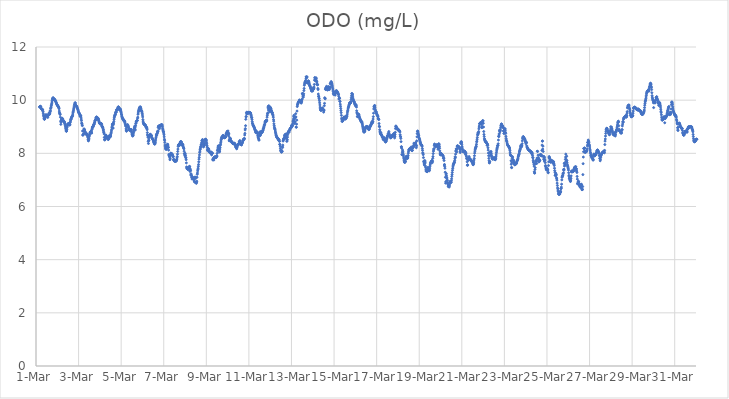
| Category | ODO (mg/L) |
|---|---|
| 44621.166666666664 | 9.74 |
| 44621.177083333336 | 9.75 |
| 44621.1875 | 9.76 |
| 44621.197916666664 | 9.76 |
| 44621.208333333336 | 9.77 |
| 44621.21875 | 9.76 |
| 44621.229166666664 | 9.74 |
| 44621.239583333336 | 9.69 |
| 44621.25 | 9.68 |
| 44621.260416666664 | 9.68 |
| 44621.270833333336 | 9.66 |
| 44621.28125 | 9.65 |
| 44621.291666666664 | 9.65 |
| 44621.302083333336 | 9.65 |
| 44621.3125 | 9.64 |
| 44621.322916666664 | 9.59 |
| 44621.333333333336 | 9.56 |
| 44621.34375 | 9.49 |
| 44621.354166666664 | 9.43 |
| 44621.364583333336 | 9.38 |
| 44621.375 | 9.32 |
| 44621.385416666664 | 9.29 |
| 44621.395833333336 | 9.28 |
| 44621.40625 | 9.29 |
| 44621.416666666664 | 9.32 |
| 44621.427083333336 | 9.34 |
| 44621.4375 | 9.38 |
| 44621.447916666664 | 9.42 |
| 44621.458333333336 | 9.44 |
| 44621.46875 | 9.45 |
| 44621.479166666664 | 9.44 |
| 44621.489583333336 | 9.43 |
| 44621.5 | 9.42 |
| 44621.510416666664 | 9.41 |
| 44621.520833333336 | 9.41 |
| 44621.53125 | 9.41 |
| 44621.541666666664 | 9.39 |
| 44621.552083333336 | 9.35 |
| 44621.5625 | 9.43 |
| 44621.572916666664 | 9.45 |
| 44621.583333333336 | 9.47 |
| 44621.59375 | 9.45 |
| 44621.604166666664 | 9.46 |
| 44621.614583333336 | 9.45 |
| 44621.625 | 9.53 |
| 44621.635416666664 | 9.48 |
| 44621.645833333336 | 9.49 |
| 44621.65625 | 9.55 |
| 44621.666666666664 | 9.6 |
| 44621.677083333336 | 9.59 |
| 44621.6875 | 9.68 |
| 44621.697916666664 | 9.71 |
| 44621.708333333336 | 9.74 |
| 44621.71875 | 9.79 |
| 44621.729166666664 | 9.83 |
| 44621.739583333336 | 9.88 |
| 44621.75 | 9.93 |
| 44621.760416666664 | 9.99 |
| 44621.770833333336 | 10.04 |
| 44621.78125 | 10.06 |
| 44621.791666666664 | 10.08 |
| 44621.802083333336 | 10.09 |
| 44621.8125 | 10.08 |
| 44621.822916666664 | 10.04 |
| 44621.833333333336 | 10.02 |
| 44621.84375 | 10.03 |
| 44621.854166666664 | 10.03 |
| 44621.864583333336 | 10.04 |
| 44621.875 | 10.03 |
| 44621.885416666664 | 10.01 |
| 44621.895833333336 | 10 |
| 44621.90625 | 9.99 |
| 44621.916666666664 | 9.97 |
| 44621.927083333336 | 9.96 |
| 44621.9375 | 9.93 |
| 44621.947916666664 | 9.91 |
| 44621.958333333336 | 9.89 |
| 44621.96875 | 9.86 |
| 44621.979166666664 | 9.84 |
| 44621.989583333336 | 9.82 |
| 44622.0 | 9.82 |
| 44622.010416666664 | 9.8 |
| 44622.020833333336 | 9.79 |
| 44622.03125 | 9.78 |
| 44622.041666666664 | 9.76 |
| 44622.052083333336 | 9.75 |
| 44622.0625 | 9.73 |
| 44622.072916666664 | 9.71 |
| 44622.083333333336 | 9.68 |
| 44622.09375 | 9.59 |
| 44622.104166666664 | 9.53 |
| 44622.114583333336 | 9.5 |
| 44622.125 | 9.48 |
| 44622.135416666664 | 9.46 |
| 44622.145833333336 | 9.36 |
| 44622.15625 | 9.21 |
| 44622.166666666664 | 9.09 |
| 44622.177083333336 | 9.17 |
| 44622.1875 | 9.25 |
| 44622.197916666664 | 9.29 |
| 44622.208333333336 | 9.28 |
| 44622.21875 | 9.29 |
| 44622.229166666664 | 9.32 |
| 44622.239583333336 | 9.3 |
| 44622.25 | 9.25 |
| 44622.260416666664 | 9.29 |
| 44622.270833333336 | 9.25 |
| 44622.28125 | 9.23 |
| 44622.291666666664 | 9.2 |
| 44622.302083333336 | 9.21 |
| 44622.3125 | 9.18 |
| 44622.322916666664 | 9.2 |
| 44622.333333333336 | 9.18 |
| 44622.34375 | 9.15 |
| 44622.354166666664 | 9.12 |
| 44622.364583333336 | 9.09 |
| 44622.375 | 9.04 |
| 44622.385416666664 | 8.99 |
| 44622.395833333336 | 8.93 |
| 44622.40625 | 8.88 |
| 44622.416666666664 | 8.84 |
| 44622.427083333336 | 8.83 |
| 44622.4375 | 8.84 |
| 44622.447916666664 | 8.9 |
| 44622.458333333336 | 8.97 |
| 44622.46875 | 9.02 |
| 44622.479166666664 | 9.06 |
| 44622.489583333336 | 9.09 |
| 44622.5 | 9.11 |
| 44622.510416666664 | 9.11 |
| 44622.520833333336 | 9.11 |
| 44622.53125 | 9.1 |
| 44622.541666666664 | 9.1 |
| 44622.552083333336 | 9.11 |
| 44622.5625 | 9.12 |
| 44622.572916666664 | 9.13 |
| 44622.583333333336 | 9.06 |
| 44622.59375 | 9.08 |
| 44622.604166666664 | 9.16 |
| 44622.614583333336 | 9.19 |
| 44622.625 | 9.25 |
| 44622.635416666664 | 9.27 |
| 44622.645833333336 | 9.31 |
| 44622.65625 | 9.29 |
| 44622.666666666664 | 9.35 |
| 44622.677083333336 | 9.35 |
| 44622.6875 | 9.39 |
| 44622.697916666664 | 9.39 |
| 44622.708333333336 | 9.4 |
| 44622.71875 | 9.43 |
| 44622.729166666664 | 9.48 |
| 44622.739583333336 | 9.54 |
| 44622.75 | 9.57 |
| 44622.760416666664 | 9.62 |
| 44622.770833333336 | 9.67 |
| 44622.78125 | 9.71 |
| 44622.791666666664 | 9.75 |
| 44622.802083333336 | 9.8 |
| 44622.8125 | 9.84 |
| 44622.822916666664 | 9.86 |
| 44622.833333333336 | 9.9 |
| 44622.84375 | 9.9 |
| 44622.854166666664 | 9.85 |
| 44622.864583333336 | 9.8 |
| 44622.875 | 9.8 |
| 44622.885416666664 | 9.79 |
| 44622.895833333336 | 9.78 |
| 44622.90625 | 9.76 |
| 44622.916666666664 | 9.76 |
| 44622.927083333336 | 9.73 |
| 44622.9375 | 9.7 |
| 44622.947916666664 | 9.69 |
| 44622.958333333336 | 9.67 |
| 44622.96875 | 9.65 |
| 44622.979166666664 | 9.61 |
| 44622.989583333336 | 9.58 |
| 44623.0 | 9.54 |
| 44623.010416666664 | 9.53 |
| 44623.020833333336 | 9.52 |
| 44623.03125 | 9.5 |
| 44623.041666666664 | 9.48 |
| 44623.052083333336 | 9.47 |
| 44623.0625 | 9.42 |
| 44623.072916666664 | 9.4 |
| 44623.083333333336 | 9.39 |
| 44623.09375 | 9.43 |
| 44623.104166666664 | 9.41 |
| 44623.114583333336 | 9.36 |
| 44623.125 | 9.29 |
| 44623.135416666664 | 9.23 |
| 44623.145833333336 | 9.14 |
| 44623.15625 | 9.12 |
| 44623.166666666664 | 9.07 |
| 44623.177083333336 | 9.04 |
| 44623.1875 | 8.84 |
| 44623.197916666664 | 8.68 |
| 44623.208333333336 | 8.7 |
| 44623.21875 | 8.7 |
| 44623.229166666664 | 8.73 |
| 44623.239583333336 | 8.83 |
| 44623.25 | 8.91 |
| 44623.260416666664 | 8.92 |
| 44623.270833333336 | 8.89 |
| 44623.28125 | 8.88 |
| 44623.291666666664 | 8.84 |
| 44623.302083333336 | 8.79 |
| 44623.3125 | 8.77 |
| 44623.322916666664 | 8.75 |
| 44623.333333333336 | 8.79 |
| 44623.34375 | 8.75 |
| 44623.354166666664 | 8.72 |
| 44623.364583333336 | 8.71 |
| 44623.375 | 8.72 |
| 44623.385416666664 | 8.72 |
| 44623.395833333336 | 8.73 |
| 44623.40625 | 8.7 |
| 44623.416666666664 | 8.67 |
| 44623.427083333336 | 8.63 |
| 44623.4375 | 8.59 |
| 44623.447916666664 | 8.52 |
| 44623.458333333336 | 8.47 |
| 44623.46875 | 8.48 |
| 44623.479166666664 | 8.51 |
| 44623.489583333336 | 8.57 |
| 44623.5 | 8.63 |
| 44623.510416666664 | 8.68 |
| 44623.520833333336 | 8.72 |
| 44623.53125 | 8.76 |
| 44623.541666666664 | 8.79 |
| 44623.552083333336 | 8.8 |
| 44623.5625 | 8.81 |
| 44623.572916666664 | 8.81 |
| 44623.583333333336 | 8.82 |
| 44623.59375 | 8.83 |
| 44623.604166666664 | 8.78 |
| 44623.614583333336 | 8.76 |
| 44623.625 | 8.89 |
| 44623.635416666664 | 8.92 |
| 44623.645833333336 | 8.96 |
| 44623.65625 | 8.99 |
| 44623.666666666664 | 9 |
| 44623.677083333336 | 9.01 |
| 44623.6875 | 9 |
| 44623.697916666664 | 9.05 |
| 44623.708333333336 | 9.07 |
| 44623.71875 | 9.09 |
| 44623.729166666664 | 9.09 |
| 44623.739583333336 | 9.12 |
| 44623.75 | 9.16 |
| 44623.760416666664 | 9.18 |
| 44623.770833333336 | 9.23 |
| 44623.78125 | 9.23 |
| 44623.791666666664 | 9.25 |
| 44623.802083333336 | 9.27 |
| 44623.8125 | 9.32 |
| 44623.822916666664 | 9.34 |
| 44623.833333333336 | 9.35 |
| 44623.84375 | 9.37 |
| 44623.854166666664 | 9.36 |
| 44623.864583333336 | 9.35 |
| 44623.875 | 9.33 |
| 44623.885416666664 | 9.33 |
| 44623.895833333336 | 9.3 |
| 44623.90625 | 9.28 |
| 44623.916666666664 | 9.32 |
| 44623.927083333336 | 9.3 |
| 44623.9375 | 9.27 |
| 44623.947916666664 | 9.23 |
| 44623.958333333336 | 9.2 |
| 44623.96875 | 9.17 |
| 44623.979166666664 | 9.14 |
| 44623.989583333336 | 9.14 |
| 44624.0 | 9.13 |
| 44624.010416666664 | 9.11 |
| 44624.020833333336 | 9.1 |
| 44624.03125 | 9.11 |
| 44624.041666666664 | 9.12 |
| 44624.052083333336 | 9.13 |
| 44624.0625 | 9.12 |
| 44624.072916666664 | 9.11 |
| 44624.083333333336 | 9.08 |
| 44624.09375 | 9.03 |
| 44624.104166666664 | 9 |
| 44624.114583333336 | 9.01 |
| 44624.125 | 8.99 |
| 44624.135416666664 | 8.97 |
| 44624.145833333336 | 8.94 |
| 44624.15625 | 8.88 |
| 44624.166666666664 | 8.88 |
| 44624.177083333336 | 8.81 |
| 44624.1875 | 8.78 |
| 44624.197916666664 | 8.73 |
| 44624.208333333336 | 8.6 |
| 44624.21875 | 8.52 |
| 44624.229166666664 | 8.5 |
| 44624.239583333336 | 8.52 |
| 44624.25 | 8.59 |
| 44624.260416666664 | 8.61 |
| 44624.270833333336 | 8.67 |
| 44624.28125 | 8.69 |
| 44624.291666666664 | 8.66 |
| 44624.302083333336 | 8.65 |
| 44624.3125 | 8.63 |
| 44624.322916666664 | 8.61 |
| 44624.333333333336 | 8.58 |
| 44624.34375 | 8.59 |
| 44624.354166666664 | 8.56 |
| 44624.364583333336 | 8.58 |
| 44624.375 | 8.56 |
| 44624.385416666664 | 8.53 |
| 44624.395833333336 | 8.52 |
| 44624.40625 | 8.53 |
| 44624.416666666664 | 8.56 |
| 44624.427083333336 | 8.62 |
| 44624.4375 | 8.66 |
| 44624.447916666664 | 8.66 |
| 44624.458333333336 | 8.65 |
| 44624.46875 | 8.63 |
| 44624.479166666664 | 8.62 |
| 44624.489583333336 | 8.62 |
| 44624.5 | 8.65 |
| 44624.510416666664 | 8.69 |
| 44624.520833333336 | 8.74 |
| 44624.53125 | 8.78 |
| 44624.541666666664 | 8.84 |
| 44624.552083333336 | 8.89 |
| 44624.5625 | 8.96 |
| 44624.572916666664 | 9.02 |
| 44624.583333333336 | 9.07 |
| 44624.59375 | 9.1 |
| 44624.604166666664 | 9.11 |
| 44624.614583333336 | 9.11 |
| 44624.625 | 8.95 |
| 44624.635416666664 | 9.08 |
| 44624.645833333336 | 9.14 |
| 44624.65625 | 9.2 |
| 44624.666666666664 | 9.28 |
| 44624.677083333336 | 9.34 |
| 44624.6875 | 9.39 |
| 44624.697916666664 | 9.42 |
| 44624.708333333336 | 9.44 |
| 44624.71875 | 9.47 |
| 44624.729166666664 | 9.46 |
| 44624.739583333336 | 9.54 |
| 44624.75 | 9.55 |
| 44624.760416666664 | 9.54 |
| 44624.770833333336 | 9.56 |
| 44624.78125 | 9.64 |
| 44624.791666666664 | 9.62 |
| 44624.802083333336 | 9.63 |
| 44624.8125 | 9.65 |
| 44624.822916666664 | 9.65 |
| 44624.833333333336 | 9.65 |
| 44624.84375 | 9.71 |
| 44624.854166666664 | 9.73 |
| 44624.864583333336 | 9.75 |
| 44624.875 | 9.74 |
| 44624.885416666664 | 9.73 |
| 44624.895833333336 | 9.71 |
| 44624.90625 | 9.68 |
| 44624.916666666664 | 9.65 |
| 44624.927083333336 | 9.64 |
| 44624.9375 | 9.65 |
| 44624.947916666664 | 9.67 |
| 44624.958333333336 | 9.67 |
| 44624.96875 | 9.64 |
| 44624.979166666664 | 9.6 |
| 44624.989583333336 | 9.57 |
| 44625.0 | 9.53 |
| 44625.010416666664 | 9.48 |
| 44625.020833333336 | 9.45 |
| 44625.03125 | 9.4 |
| 44625.041666666664 | 9.37 |
| 44625.052083333336 | 9.34 |
| 44625.0625 | 9.32 |
| 44625.072916666664 | 9.3 |
| 44625.083333333336 | 9.29 |
| 44625.09375 | 9.27 |
| 44625.104166666664 | 9.27 |
| 44625.114583333336 | 9.26 |
| 44625.125 | 9.25 |
| 44625.135416666664 | 9.22 |
| 44625.145833333336 | 9.2 |
| 44625.15625 | 9.22 |
| 44625.166666666664 | 9.2 |
| 44625.177083333336 | 9.17 |
| 44625.1875 | 9.12 |
| 44625.197916666664 | 9.09 |
| 44625.208333333336 | 9.04 |
| 44625.21875 | 9.02 |
| 44625.229166666664 | 8.92 |
| 44625.239583333336 | 8.87 |
| 44625.25 | 8.83 |
| 44625.260416666664 | 8.86 |
| 44625.270833333336 | 8.98 |
| 44625.28125 | 9.03 |
| 44625.291666666664 | 9.06 |
| 44625.302083333336 | 9.08 |
| 44625.3125 | 9.06 |
| 44625.322916666664 | 9.03 |
| 44625.333333333336 | 9.02 |
| 44625.34375 | 8.98 |
| 44625.354166666664 | 8.95 |
| 44625.364583333336 | 8.9 |
| 44625.375 | 8.91 |
| 44625.385416666664 | 8.87 |
| 44625.395833333336 | 8.89 |
| 44625.40625 | 8.86 |
| 44625.416666666664 | 8.88 |
| 44625.427083333336 | 8.88 |
| 44625.4375 | 8.88 |
| 44625.447916666664 | 8.89 |
| 44625.458333333336 | 8.9 |
| 44625.46875 | 8.89 |
| 44625.479166666664 | 8.86 |
| 44625.489583333336 | 8.81 |
| 44625.5 | 8.77 |
| 44625.510416666664 | 8.72 |
| 44625.520833333336 | 8.69 |
| 44625.53125 | 8.67 |
| 44625.541666666664 | 8.65 |
| 44625.552083333336 | 8.66 |
| 44625.5625 | 8.68 |
| 44625.572916666664 | 8.73 |
| 44625.583333333336 | 8.79 |
| 44625.59375 | 8.84 |
| 44625.604166666664 | 8.89 |
| 44625.614583333336 | 8.94 |
| 44625.625 | 8.97 |
| 44625.635416666664 | 9.01 |
| 44625.645833333336 | 9.03 |
| 44625.65625 | 8.96 |
| 44625.666666666664 | 8.88 |
| 44625.677083333336 | 9.04 |
| 44625.6875 | 9.12 |
| 44625.697916666664 | 9.14 |
| 44625.708333333336 | 9.19 |
| 44625.71875 | 9.2 |
| 44625.729166666664 | 9.21 |
| 44625.739583333336 | 9.23 |
| 44625.75 | 9.23 |
| 44625.760416666664 | 9.24 |
| 44625.770833333336 | 9.32 |
| 44625.78125 | 9.36 |
| 44625.791666666664 | 9.47 |
| 44625.802083333336 | 9.52 |
| 44625.8125 | 9.58 |
| 44625.822916666664 | 9.6 |
| 44625.833333333336 | 9.65 |
| 44625.84375 | 9.67 |
| 44625.854166666664 | 9.7 |
| 44625.864583333336 | 9.72 |
| 44625.875 | 9.74 |
| 44625.885416666664 | 9.71 |
| 44625.895833333336 | 9.7 |
| 44625.90625 | 9.75 |
| 44625.916666666664 | 9.71 |
| 44625.927083333336 | 9.69 |
| 44625.9375 | 9.62 |
| 44625.947916666664 | 9.61 |
| 44625.958333333336 | 9.61 |
| 44625.96875 | 9.58 |
| 44625.979166666664 | 9.55 |
| 44625.989583333336 | 9.5 |
| 44626.0 | 9.44 |
| 44626.010416666664 | 9.37 |
| 44626.020833333336 | 9.27 |
| 44626.03125 | 9.21 |
| 44626.041666666664 | 9.16 |
| 44626.052083333336 | 9.13 |
| 44626.0625 | 9.11 |
| 44626.072916666664 | 9.09 |
| 44626.083333333336 | 9.08 |
| 44626.09375 | 9.08 |
| 44626.104166666664 | 9.08 |
| 44626.114583333336 | 9.08 |
| 44626.125 | 9.07 |
| 44626.135416666664 | 9.06 |
| 44626.145833333336 | 9.04 |
| 44626.15625 | 9.02 |
| 44626.166666666664 | 8.99 |
| 44626.177083333336 | 8.97 |
| 44626.1875 | 8.99 |
| 44626.197916666664 | 8.97 |
| 44626.208333333336 | 8.94 |
| 44626.21875 | 8.89 |
| 44626.229166666664 | 8.78 |
| 44626.239583333336 | 8.7 |
| 44626.25 | 8.66 |
| 44626.260416666664 | 8.6 |
| 44626.270833333336 | 8.45 |
| 44626.28125 | 8.37 |
| 44626.291666666664 | 8.5 |
| 44626.302083333336 | 8.48 |
| 44626.3125 | 8.58 |
| 44626.322916666664 | 8.64 |
| 44626.333333333336 | 8.63 |
| 44626.34375 | 8.69 |
| 44626.354166666664 | 8.7 |
| 44626.364583333336 | 8.72 |
| 44626.375 | 8.69 |
| 44626.385416666664 | 8.7 |
| 44626.395833333336 | 8.69 |
| 44626.40625 | 8.68 |
| 44626.416666666664 | 8.67 |
| 44626.427083333336 | 8.66 |
| 44626.4375 | 8.6 |
| 44626.447916666664 | 8.58 |
| 44626.458333333336 | 8.55 |
| 44626.46875 | 8.55 |
| 44626.479166666664 | 8.54 |
| 44626.489583333336 | 8.53 |
| 44626.5 | 8.52 |
| 44626.510416666664 | 8.48 |
| 44626.520833333336 | 8.45 |
| 44626.53125 | 8.42 |
| 44626.541666666664 | 8.41 |
| 44626.552083333336 | 8.38 |
| 44626.5625 | 8.36 |
| 44626.572916666664 | 8.35 |
| 44626.583333333336 | 8.35 |
| 44626.59375 | 8.37 |
| 44626.604166666664 | 8.41 |
| 44626.614583333336 | 8.47 |
| 44626.625 | 8.54 |
| 44626.635416666664 | 8.59 |
| 44626.645833333336 | 8.65 |
| 44626.65625 | 8.7 |
| 44626.666666666664 | 8.72 |
| 44626.677083333336 | 8.69 |
| 44626.6875 | 8.74 |
| 44626.697916666664 | 8.76 |
| 44626.708333333336 | 8.81 |
| 44626.71875 | 8.84 |
| 44626.729166666664 | 8.82 |
| 44626.739583333336 | 8.97 |
| 44626.75 | 9.02 |
| 44626.760416666664 | 9.02 |
| 44626.770833333336 | 9.02 |
| 44626.78125 | 9.01 |
| 44626.791666666664 | 8.92 |
| 44626.802083333336 | 8.96 |
| 44626.8125 | 9.02 |
| 44626.822916666664 | 9.05 |
| 44626.833333333336 | 9.05 |
| 44626.84375 | 9.06 |
| 44626.854166666664 | 9.04 |
| 44626.864583333336 | 9.05 |
| 44626.875 | 9.05 |
| 44626.885416666664 | 9.07 |
| 44626.895833333336 | 9.08 |
| 44626.90625 | 9.08 |
| 44626.916666666664 | 9.06 |
| 44626.927083333336 | 9.06 |
| 44626.9375 | 9 |
| 44626.947916666664 | 8.94 |
| 44626.958333333336 | 8.9 |
| 44626.96875 | 8.86 |
| 44626.979166666664 | 8.82 |
| 44626.989583333336 | 8.81 |
| 44627.0 | 8.76 |
| 44627.010416666664 | 8.7 |
| 44627.020833333336 | 8.62 |
| 44627.03125 | 8.53 |
| 44627.041666666664 | 8.49 |
| 44627.052083333336 | 8.41 |
| 44627.0625 | 8.31 |
| 44627.072916666664 | 8.25 |
| 44627.083333333336 | 8.2 |
| 44627.09375 | 8.17 |
| 44627.104166666664 | 8.16 |
| 44627.114583333336 | 8.15 |
| 44627.125 | 8.16 |
| 44627.135416666664 | 8.21 |
| 44627.145833333336 | 8.26 |
| 44627.15625 | 8.3 |
| 44627.166666666664 | 8.33 |
| 44627.177083333336 | 8.33 |
| 44627.1875 | 8.34 |
| 44627.197916666664 | 8.28 |
| 44627.208333333336 | 8.23 |
| 44627.21875 | 8.22 |
| 44627.229166666664 | 8.12 |
| 44627.239583333336 | 7.96 |
| 44627.25 | 7.91 |
| 44627.260416666664 | 7.91 |
| 44627.270833333336 | 7.89 |
| 44627.28125 | 7.85 |
| 44627.291666666664 | 7.76 |
| 44627.302083333336 | 7.81 |
| 44627.3125 | 7.93 |
| 44627.322916666664 | 7.97 |
| 44627.333333333336 | 8.01 |
| 44627.34375 | 8 |
| 44627.354166666664 | 7.99 |
| 44627.364583333336 | 7.99 |
| 44627.375 | 7.98 |
| 44627.385416666664 | 7.98 |
| 44627.395833333336 | 7.96 |
| 44627.40625 | 7.94 |
| 44627.416666666664 | 7.92 |
| 44627.427083333336 | 7.9 |
| 44627.4375 | 7.88 |
| 44627.447916666664 | 7.87 |
| 44627.458333333336 | 7.77 |
| 44627.46875 | 7.74 |
| 44627.479166666664 | 7.77 |
| 44627.489583333336 | 7.74 |
| 44627.5 | 7.71 |
| 44627.510416666664 | 7.7 |
| 44627.520833333336 | 7.72 |
| 44627.53125 | 7.73 |
| 44627.541666666664 | 7.73 |
| 44627.552083333336 | 7.7 |
| 44627.5625 | 7.7 |
| 44627.572916666664 | 7.71 |
| 44627.583333333336 | 7.71 |
| 44627.59375 | 7.73 |
| 44627.604166666664 | 7.75 |
| 44627.614583333336 | 7.78 |
| 44627.625 | 7.83 |
| 44627.635416666664 | 7.88 |
| 44627.645833333336 | 7.97 |
| 44627.65625 | 8.07 |
| 44627.666666666664 | 8.16 |
| 44627.677083333336 | 8.26 |
| 44627.6875 | 8.3 |
| 44627.697916666664 | 8.32 |
| 44627.708333333336 | 8.33 |
| 44627.71875 | 8.33 |
| 44627.729166666664 | 8.29 |
| 44627.739583333336 | 8.31 |
| 44627.75 | 8.34 |
| 44627.760416666664 | 8.37 |
| 44627.770833333336 | 8.42 |
| 44627.78125 | 8.42 |
| 44627.791666666664 | 8.44 |
| 44627.802083333336 | 8.44 |
| 44627.8125 | 8.43 |
| 44627.822916666664 | 8.43 |
| 44627.833333333336 | 8.41 |
| 44627.84375 | 8.36 |
| 44627.854166666664 | 8.31 |
| 44627.864583333336 | 8.31 |
| 44627.875 | 8.34 |
| 44627.885416666664 | 8.34 |
| 44627.895833333336 | 8.33 |
| 44627.90625 | 8.28 |
| 44627.916666666664 | 8.24 |
| 44627.927083333336 | 8.21 |
| 44627.9375 | 8.2 |
| 44627.947916666664 | 8.17 |
| 44627.958333333336 | 8.08 |
| 44627.96875 | 7.99 |
| 44627.979166666664 | 7.98 |
| 44627.989583333336 | 7.91 |
| 44628.0 | 8 |
| 44628.010416666664 | 7.97 |
| 44628.020833333336 | 7.91 |
| 44628.03125 | 7.84 |
| 44628.041666666664 | 7.83 |
| 44628.052083333336 | 7.76 |
| 44628.0625 | 7.64 |
| 44628.072916666664 | 7.49 |
| 44628.083333333336 | 7.43 |
| 44628.09375 | 7.46 |
| 44628.104166666664 | 7.46 |
| 44628.114583333336 | 7.43 |
| 44628.125 | 7.41 |
| 44628.135416666664 | 7.4 |
| 44628.145833333336 | 7.39 |
| 44628.15625 | 7.42 |
| 44628.166666666664 | 7.45 |
| 44628.177083333336 | 7.45 |
| 44628.1875 | 7.48 |
| 44628.197916666664 | 7.49 |
| 44628.208333333336 | 7.51 |
| 44628.21875 | 7.5 |
| 44628.229166666664 | 7.32 |
| 44628.239583333336 | 7.42 |
| 44628.25 | 7.38 |
| 44628.260416666664 | 7.35 |
| 44628.270833333336 | 7.19 |
| 44628.28125 | 7.23 |
| 44628.291666666664 | 7.17 |
| 44628.302083333336 | 7.18 |
| 44628.3125 | 7.09 |
| 44628.322916666664 | 7.12 |
| 44628.333333333336 | 7.03 |
| 44628.34375 | 7.06 |
| 44628.354166666664 | 7.1 |
| 44628.364583333336 | 7.09 |
| 44628.375 | 7.06 |
| 44628.385416666664 | 7.06 |
| 44628.395833333336 | 7.03 |
| 44628.40625 | 7.05 |
| 44628.416666666664 | 7.03 |
| 44628.427083333336 | 7 |
| 44628.4375 | 6.95 |
| 44628.447916666664 | 6.93 |
| 44628.458333333336 | 6.92 |
| 44628.46875 | 7.11 |
| 44628.479166666664 | 7.08 |
| 44628.489583333336 | 7.09 |
| 44628.5 | 7.06 |
| 44628.510416666664 | 6.9 |
| 44628.520833333336 | 6.91 |
| 44628.53125 | 6.87 |
| 44628.541666666664 | 6.91 |
| 44628.552083333336 | 6.95 |
| 44628.5625 | 7.1 |
| 44628.572916666664 | 7.21 |
| 44628.583333333336 | 7.26 |
| 44628.59375 | 7.34 |
| 44628.604166666664 | 7.39 |
| 44628.614583333336 | 7.44 |
| 44628.625 | 7.51 |
| 44628.635416666664 | 7.58 |
| 44628.645833333336 | 7.68 |
| 44628.65625 | 7.78 |
| 44628.666666666664 | 7.85 |
| 44628.677083333336 | 7.94 |
| 44628.6875 | 8.03 |
| 44628.697916666664 | 8.08 |
| 44628.708333333336 | 8.14 |
| 44628.71875 | 8.17 |
| 44628.729166666664 | 8.22 |
| 44628.739583333336 | 8.26 |
| 44628.75 | 8.27 |
| 44628.760416666664 | 8.33 |
| 44628.770833333336 | 8.34 |
| 44628.78125 | 8.4 |
| 44628.791666666664 | 8.47 |
| 44628.802083333336 | 8.49 |
| 44628.8125 | 8.46 |
| 44628.822916666664 | 8.52 |
| 44628.833333333336 | 8.48 |
| 44628.84375 | 8.42 |
| 44628.854166666664 | 8.34 |
| 44628.864583333336 | 8.24 |
| 44628.875 | 8.3 |
| 44628.885416666664 | 8.28 |
| 44628.895833333336 | 8.29 |
| 44628.90625 | 8.31 |
| 44628.916666666664 | 8.35 |
| 44628.927083333336 | 8.38 |
| 44628.9375 | 8.46 |
| 44628.947916666664 | 8.52 |
| 44628.958333333336 | 8.53 |
| 44628.96875 | 8.52 |
| 44628.979166666664 | 8.52 |
| 44628.989583333336 | 8.5 |
| 44629.0 | 8.49 |
| 44629.010416666664 | 8.42 |
| 44629.020833333336 | 8.36 |
| 44629.03125 | 8.29 |
| 44629.041666666664 | 8.23 |
| 44629.052083333336 | 8.13 |
| 44629.0625 | 8.1 |
| 44629.072916666664 | 8.15 |
| 44629.083333333336 | 8.18 |
| 44629.09375 | 8.18 |
| 44629.104166666664 | 8.17 |
| 44629.114583333336 | 8.14 |
| 44629.125 | 8.1 |
| 44629.135416666664 | 8.06 |
| 44629.145833333336 | 8.04 |
| 44629.15625 | 8.05 |
| 44629.166666666664 | 8.06 |
| 44629.177083333336 | 8.03 |
| 44629.1875 | 8.01 |
| 44629.197916666664 | 8 |
| 44629.208333333336 | 8.01 |
| 44629.21875 | 8.03 |
| 44629.229166666664 | 8.05 |
| 44629.239583333336 | 8.03 |
| 44629.25 | 7.94 |
| 44629.260416666664 | 7.99 |
| 44629.270833333336 | 8 |
| 44629.28125 | 8.01 |
| 44629.291666666664 | 8 |
| 44629.302083333336 | 7.76 |
| 44629.3125 | 7.75 |
| 44629.322916666664 | 7.81 |
| 44629.333333333336 | 7.8 |
| 44629.34375 | 7.78 |
| 44629.354166666664 | 7.75 |
| 44629.364583333336 | 7.81 |
| 44629.375 | 7.85 |
| 44629.385416666664 | 7.86 |
| 44629.395833333336 | 7.86 |
| 44629.40625 | 7.86 |
| 44629.416666666664 | 7.85 |
| 44629.427083333336 | 7.85 |
| 44629.4375 | 7.85 |
| 44629.447916666664 | 7.86 |
| 44629.458333333336 | 7.85 |
| 44629.46875 | 7.84 |
| 44629.479166666664 | 7.89 |
| 44629.489583333336 | 7.91 |
| 44629.5 | 7.89 |
| 44629.510416666664 | 8 |
| 44629.520833333336 | 8.1 |
| 44629.53125 | 8.13 |
| 44629.541666666664 | 8.2 |
| 44629.552083333336 | 8.24 |
| 44629.5625 | 8.28 |
| 44629.572916666664 | 8.28 |
| 44629.583333333336 | 8.16 |
| 44629.59375 | 8.11 |
| 44629.604166666664 | 8.08 |
| 44629.614583333336 | 8.05 |
| 44629.625 | 8.08 |
| 44629.635416666664 | 8.16 |
| 44629.645833333336 | 8.22 |
| 44629.65625 | 8.3 |
| 44629.666666666664 | 8.34 |
| 44629.677083333336 | 8.4 |
| 44629.6875 | 8.46 |
| 44629.697916666664 | 8.51 |
| 44629.708333333336 | 8.55 |
| 44629.71875 | 8.6 |
| 44629.729166666664 | 8.61 |
| 44629.739583333336 | 8.61 |
| 44629.75 | 8.58 |
| 44629.760416666664 | 8.59 |
| 44629.770833333336 | 8.67 |
| 44629.78125 | 8.59 |
| 44629.791666666664 | 8.62 |
| 44629.802083333336 | 8.67 |
| 44629.8125 | 8.65 |
| 44629.822916666664 | 8.61 |
| 44629.833333333336 | 8.6 |
| 44629.84375 | 8.59 |
| 44629.854166666664 | 8.59 |
| 44629.864583333336 | 8.59 |
| 44629.875 | 8.6 |
| 44629.885416666664 | 8.62 |
| 44629.895833333336 | 8.6 |
| 44629.90625 | 8.65 |
| 44629.916666666664 | 8.62 |
| 44629.927083333336 | 8.72 |
| 44629.9375 | 8.74 |
| 44629.947916666664 | 8.75 |
| 44629.958333333336 | 8.79 |
| 44629.96875 | 8.77 |
| 44629.979166666664 | 8.83 |
| 44629.989583333336 | 8.79 |
| 44630.0 | 8.73 |
| 44630.010416666664 | 8.71 |
| 44630.020833333336 | 8.84 |
| 44630.03125 | 8.76 |
| 44630.041666666664 | 8.76 |
| 44630.052083333336 | 8.65 |
| 44630.0625 | 8.73 |
| 44630.072916666664 | 8.47 |
| 44630.083333333336 | 8.51 |
| 44630.09375 | 8.49 |
| 44630.104166666664 | 8.58 |
| 44630.114583333336 | 8.57 |
| 44630.125 | 8.56 |
| 44630.135416666664 | 8.54 |
| 44630.145833333336 | 8.48 |
| 44630.15625 | 8.47 |
| 44630.166666666664 | 8.46 |
| 44630.177083333336 | 8.44 |
| 44630.1875 | 8.44 |
| 44630.197916666664 | 8.42 |
| 44630.208333333336 | 8.4 |
| 44630.21875 | 8.39 |
| 44630.229166666664 | 8.39 |
| 44630.239583333336 | 8.38 |
| 44630.25 | 8.37 |
| 44630.260416666664 | 8.37 |
| 44630.270833333336 | 8.37 |
| 44630.28125 | 8.38 |
| 44630.291666666664 | 8.35 |
| 44630.302083333336 | 8.39 |
| 44630.3125 | 8.36 |
| 44630.322916666664 | 8.37 |
| 44630.333333333336 | 8.37 |
| 44630.34375 | 8.35 |
| 44630.354166666664 | 8.33 |
| 44630.364583333336 | 8.3 |
| 44630.375 | 8.26 |
| 44630.385416666664 | 8.23 |
| 44630.395833333336 | 8.24 |
| 44630.40625 | 8.21 |
| 44630.416666666664 | 8.19 |
| 44630.427083333336 | 8.17 |
| 44630.4375 | 8.23 |
| 44630.447916666664 | 8.24 |
| 44630.458333333336 | 8.3 |
| 44630.46875 | 8.3 |
| 44630.479166666664 | 8.33 |
| 44630.489583333336 | 8.31 |
| 44630.5 | 8.33 |
| 44630.510416666664 | 8.36 |
| 44630.520833333336 | 8.35 |
| 44630.53125 | 8.35 |
| 44630.541666666664 | 8.43 |
| 44630.552083333336 | 8.43 |
| 44630.5625 | 8.44 |
| 44630.572916666664 | 8.48 |
| 44630.583333333336 | 8.46 |
| 44630.59375 | 8.37 |
| 44630.604166666664 | 8.37 |
| 44630.614583333336 | 8.35 |
| 44630.625 | 8.34 |
| 44630.635416666664 | 8.33 |
| 44630.645833333336 | 8.32 |
| 44630.65625 | 8.32 |
| 44630.666666666664 | 8.36 |
| 44630.677083333336 | 8.38 |
| 44630.6875 | 8.4 |
| 44630.697916666664 | 8.41 |
| 44630.708333333336 | 8.46 |
| 44630.71875 | 8.47 |
| 44630.729166666664 | 8.5 |
| 44630.739583333336 | 8.51 |
| 44630.75 | 8.53 |
| 44630.760416666664 | 8.54 |
| 44630.770833333336 | 8.52 |
| 44630.78125 | 8.55 |
| 44630.791666666664 | 8.56 |
| 44630.802083333336 | 8.69 |
| 44630.8125 | 8.75 |
| 44630.822916666664 | 8.88 |
| 44630.833333333336 | 8.93 |
| 44630.84375 | 9.04 |
| 44630.854166666664 | 9.28 |
| 44630.864583333336 | 9.37 |
| 44630.875 | 9.39 |
| 44630.885416666664 | 9.53 |
| 44630.895833333336 | 9.48 |
| 44630.90625 | 9.55 |
| 44630.916666666664 | 9.5 |
| 44630.927083333336 | 9.52 |
| 44630.9375 | 9.52 |
| 44630.947916666664 | 9.52 |
| 44630.958333333336 | 9.52 |
| 44630.96875 | 9.51 |
| 44630.979166666664 | 9.52 |
| 44630.989583333336 | 9.53 |
| 44631.0 | 9.55 |
| 44631.010416666664 | 9.52 |
| 44631.020833333336 | 9.53 |
| 44631.03125 | 9.53 |
| 44631.041666666664 | 9.53 |
| 44631.052083333336 | 9.53 |
| 44631.0625 | 9.52 |
| 44631.072916666664 | 9.52 |
| 44631.083333333336 | 9.51 |
| 44631.09375 | 9.45 |
| 44631.104166666664 | 9.44 |
| 44631.114583333336 | 9.4 |
| 44631.125 | 9.34 |
| 44631.135416666664 | 9.34 |
| 44631.145833333336 | 9.27 |
| 44631.15625 | 9.19 |
| 44631.166666666664 | 9.13 |
| 44631.177083333336 | 9.11 |
| 44631.1875 | 9.07 |
| 44631.197916666664 | 9.06 |
| 44631.208333333336 | 9.04 |
| 44631.21875 | 9.03 |
| 44631.229166666664 | 9.01 |
| 44631.239583333336 | 8.99 |
| 44631.25 | 8.97 |
| 44631.260416666664 | 8.95 |
| 44631.270833333336 | 8.92 |
| 44631.28125 | 8.89 |
| 44631.291666666664 | 8.88 |
| 44631.302083333336 | 8.86 |
| 44631.3125 | 8.82 |
| 44631.322916666664 | 8.78 |
| 44631.333333333336 | 8.79 |
| 44631.34375 | 8.84 |
| 44631.354166666664 | 8.82 |
| 44631.364583333336 | 8.79 |
| 44631.375 | 8.78 |
| 44631.385416666664 | 8.76 |
| 44631.395833333336 | 8.76 |
| 44631.40625 | 8.75 |
| 44631.416666666664 | 8.68 |
| 44631.427083333336 | 8.62 |
| 44631.4375 | 8.61 |
| 44631.447916666664 | 8.57 |
| 44631.458333333336 | 8.54 |
| 44631.46875 | 8.5 |
| 44631.479166666664 | 8.5 |
| 44631.489583333336 | 8.68 |
| 44631.5 | 8.8 |
| 44631.510416666664 | 8.76 |
| 44631.520833333336 | 8.66 |
| 44631.53125 | 8.68 |
| 44631.541666666664 | 8.7 |
| 44631.552083333336 | 8.76 |
| 44631.5625 | 8.82 |
| 44631.572916666664 | 8.78 |
| 44631.583333333336 | 8.75 |
| 44631.59375 | 8.78 |
| 44631.604166666664 | 8.83 |
| 44631.614583333336 | 8.8 |
| 44631.625 | 8.81 |
| 44631.635416666664 | 8.8 |
| 44631.645833333336 | 8.85 |
| 44631.65625 | 8.85 |
| 44631.666666666664 | 8.88 |
| 44631.677083333336 | 8.93 |
| 44631.6875 | 8.93 |
| 44631.697916666664 | 8.98 |
| 44631.708333333336 | 9 |
| 44631.71875 | 9.04 |
| 44631.729166666664 | 9.08 |
| 44631.739583333336 | 9.08 |
| 44631.75 | 9.14 |
| 44631.760416666664 | 9.18 |
| 44631.770833333336 | 9.2 |
| 44631.78125 | 9.17 |
| 44631.791666666664 | 9.22 |
| 44631.802083333336 | 9.23 |
| 44631.8125 | 9.24 |
| 44631.822916666664 | 9.24 |
| 44631.833333333336 | 9.21 |
| 44631.84375 | 9.25 |
| 44631.854166666664 | 9.36 |
| 44631.864583333336 | 9.43 |
| 44631.875 | 9.49 |
| 44631.885416666664 | 9.52 |
| 44631.895833333336 | 9.71 |
| 44631.90625 | 9.77 |
| 44631.916666666664 | 9.63 |
| 44631.927083333336 | 9.75 |
| 44631.9375 | 9.79 |
| 44631.947916666664 | 9.69 |
| 44631.958333333336 | 9.64 |
| 44631.96875 | 9.61 |
| 44631.979166666664 | 9.56 |
| 44631.989583333336 | 9.6 |
| 44632.0 | 9.72 |
| 44632.010416666664 | 9.73 |
| 44632.020833333336 | 9.7 |
| 44632.03125 | 9.68 |
| 44632.041666666664 | 9.66 |
| 44632.052083333336 | 9.61 |
| 44632.0625 | 9.59 |
| 44632.072916666664 | 9.56 |
| 44632.083333333336 | 9.52 |
| 44632.09375 | 9.53 |
| 44632.104166666664 | 9.53 |
| 44632.114583333336 | 9.47 |
| 44632.125 | 9.45 |
| 44632.135416666664 | 9.41 |
| 44632.145833333336 | 9.36 |
| 44632.15625 | 9.27 |
| 44632.166666666664 | 9.21 |
| 44632.177083333336 | 9.11 |
| 44632.1875 | 9.04 |
| 44632.197916666664 | 8.98 |
| 44632.208333333336 | 8.93 |
| 44632.21875 | 8.92 |
| 44632.229166666664 | 8.89 |
| 44632.239583333336 | 8.84 |
| 44632.25 | 8.79 |
| 44632.260416666664 | 8.75 |
| 44632.270833333336 | 8.7 |
| 44632.28125 | 8.67 |
| 44632.291666666664 | 8.65 |
| 44632.302083333336 | 8.62 |
| 44632.3125 | 8.6 |
| 44632.322916666664 | 8.59 |
| 44632.333333333336 | 8.58 |
| 44632.34375 | 8.59 |
| 44632.354166666664 | 8.57 |
| 44632.364583333336 | 8.55 |
| 44632.375 | 8.51 |
| 44632.385416666664 | 8.52 |
| 44632.395833333336 | 8.52 |
| 44632.40625 | 8.52 |
| 44632.416666666664 | 8.51 |
| 44632.427083333336 | 8.46 |
| 44632.4375 | 8.45 |
| 44632.447916666664 | 8.34 |
| 44632.458333333336 | 8.33 |
| 44632.46875 | 8.27 |
| 44632.479166666664 | 8.19 |
| 44632.489583333336 | 8.12 |
| 44632.5 | 8.1 |
| 44632.510416666664 | 8.07 |
| 44632.520833333336 | 8.08 |
| 44632.53125 | 8.04 |
| 44632.541666666664 | 8.11 |
| 44632.552083333336 | 8.07 |
| 44632.5625 | 8.07 |
| 44632.572916666664 | 8.25 |
| 44632.583333333336 | 8.22 |
| 44632.59375 | 8.31 |
| 44632.604166666664 | 8.46 |
| 44632.614583333336 | 8.49 |
| 44632.625 | 8.52 |
| 44632.635416666664 | 8.55 |
| 44632.645833333336 | 8.56 |
| 44632.65625 | 8.57 |
| 44632.666666666664 | 8.61 |
| 44632.677083333336 | 8.67 |
| 44632.6875 | 8.69 |
| 44632.697916666664 | 8.67 |
| 44632.708333333336 | 8.7 |
| 44632.71875 | 8.72 |
| 44632.729166666664 | 8.58 |
| 44632.739583333336 | 8.62 |
| 44632.75 | 8.56 |
| 44632.760416666664 | 8.66 |
| 44632.770833333336 | 8.73 |
| 44632.78125 | 8.45 |
| 44632.791666666664 | 8.47 |
| 44632.802083333336 | 8.52 |
| 44632.8125 | 8.61 |
| 44632.822916666664 | 8.7 |
| 44632.833333333336 | 8.77 |
| 44632.84375 | 8.8 |
| 44632.854166666664 | 8.8 |
| 44632.864583333336 | 8.83 |
| 44632.875 | 8.83 |
| 44632.885416666664 | 8.79 |
| 44632.895833333336 | 8.85 |
| 44632.90625 | 8.87 |
| 44632.916666666664 | 8.87 |
| 44632.927083333336 | 8.91 |
| 44632.9375 | 8.93 |
| 44632.947916666664 | 8.94 |
| 44632.958333333336 | 8.94 |
| 44632.96875 | 8.95 |
| 44632.979166666664 | 8.97 |
| 44632.989583333336 | 8.98 |
| 44633.0 | 9.05 |
| 44633.010416666664 | 9.03 |
| 44633.020833333336 | 9.01 |
| 44633.03125 | 9.05 |
| 44633.041666666664 | 9.03 |
| 44633.052083333336 | 9.06 |
| 44633.0625 | 9.13 |
| 44633.072916666664 | 9.2 |
| 44633.083333333336 | 9.23 |
| 44633.09375 | 9.29 |
| 44633.104166666664 | 9.39 |
| 44633.114583333336 | 9.43 |
| 44633.125 | 9.34 |
| 44633.135416666664 | 9.28 |
| 44633.145833333336 | 9.12 |
| 44633.15625 | 9.19 |
| 44633.166666666664 | 9.18 |
| 44633.177083333336 | 9.34 |
| 44633.1875 | 9.36 |
| 44633.197916666664 | 9.49 |
| 44633.208333333336 | 9.37 |
| 44633.21875 | 8.99 |
| 44633.229166666664 | 8.98 |
| 44633.239583333336 | 9.1 |
| 44633.25 | 9.25 |
| 44633.260416666664 | 9.59 |
| 44633.270833333336 | 9.76 |
| 44633.28125 | 9.82 |
| 44633.291666666664 | 9.85 |
| 44633.302083333336 | 9.87 |
| 44633.3125 | 9.9 |
| 44633.322916666664 | 9.92 |
| 44633.333333333336 | 9.93 |
| 44633.34375 | 9.94 |
| 44633.354166666664 | 9.95 |
| 44633.364583333336 | 9.98 |
| 44633.375 | 10.01 |
| 44633.385416666664 | 9.98 |
| 44633.395833333336 | 9.97 |
| 44633.40625 | 9.95 |
| 44633.416666666664 | 9.95 |
| 44633.427083333336 | 9.94 |
| 44633.4375 | 9.92 |
| 44633.447916666664 | 9.9 |
| 44633.458333333336 | 9.89 |
| 44633.46875 | 9.93 |
| 44633.479166666664 | 9.96 |
| 44633.489583333336 | 10.01 |
| 44633.5 | 10.04 |
| 44633.510416666664 | 10.25 |
| 44633.520833333336 | 10.25 |
| 44633.53125 | 10.2 |
| 44633.541666666664 | 10.14 |
| 44633.552083333336 | 10.11 |
| 44633.5625 | 10.18 |
| 44633.572916666664 | 10.24 |
| 44633.583333333336 | 10.36 |
| 44633.59375 | 10.44 |
| 44633.604166666664 | 10.56 |
| 44633.614583333336 | 10.61 |
| 44633.625 | 10.65 |
| 44633.635416666664 | 10.68 |
| 44633.645833333336 | 10.69 |
| 44633.65625 | 10.71 |
| 44633.666666666664 | 10.73 |
| 44633.677083333336 | 10.8 |
| 44633.6875 | 10.88 |
| 44633.697916666664 | 10.87 |
| 44633.708333333336 | 10.85 |
| 44633.71875 | 10.85 |
| 44633.729166666664 | 10.88 |
| 44633.739583333336 | 10.66 |
| 44633.75 | 10.64 |
| 44633.760416666664 | 10.66 |
| 44633.770833333336 | 10.66 |
| 44633.78125 | 10.68 |
| 44633.791666666664 | 10.73 |
| 44633.802083333336 | 10.7 |
| 44633.8125 | 10.71 |
| 44633.822916666664 | 10.66 |
| 44633.833333333336 | 10.62 |
| 44633.84375 | 10.57 |
| 44633.854166666664 | 10.55 |
| 44633.864583333336 | 10.54 |
| 44633.875 | 10.51 |
| 44633.885416666664 | 10.5 |
| 44633.895833333336 | 10.47 |
| 44633.90625 | 10.44 |
| 44633.916666666664 | 10.42 |
| 44633.927083333336 | 10.39 |
| 44633.9375 | 10.35 |
| 44633.947916666664 | 10.35 |
| 44633.958333333336 | 10.35 |
| 44633.96875 | 10.37 |
| 44633.979166666664 | 10.36 |
| 44633.989583333336 | 10.34 |
| 44634.0 | 10.39 |
| 44634.010416666664 | 10.39 |
| 44634.020833333336 | 10.47 |
| 44634.03125 | 10.43 |
| 44634.041666666664 | 10.42 |
| 44634.052083333336 | 10.43 |
| 44634.0625 | 10.49 |
| 44634.072916666664 | 10.59 |
| 44634.083333333336 | 10.75 |
| 44634.09375 | 10.85 |
| 44634.104166666664 | 10.83 |
| 44634.114583333336 | 10.79 |
| 44634.125 | 10.79 |
| 44634.135416666664 | 10.72 |
| 44634.145833333336 | 10.83 |
| 44634.15625 | 10.84 |
| 44634.166666666664 | 10.8 |
| 44634.177083333336 | 10.72 |
| 44634.1875 | 10.7 |
| 44634.197916666664 | 10.64 |
| 44634.208333333336 | 10.59 |
| 44634.21875 | 10.58 |
| 44634.229166666664 | 10.58 |
| 44634.239583333336 | 10.44 |
| 44634.25 | 10.4 |
| 44634.260416666664 | 10.23 |
| 44634.270833333336 | 10.14 |
| 44634.28125 | 10.15 |
| 44634.291666666664 | 10.08 |
| 44634.302083333336 | 10.05 |
| 44634.3125 | 9.98 |
| 44634.322916666664 | 9.9 |
| 44634.333333333336 | 9.82 |
| 44634.34375 | 9.74 |
| 44634.354166666664 | 9.68 |
| 44634.364583333336 | 9.64 |
| 44634.375 | 9.62 |
| 44634.385416666664 | 9.62 |
| 44634.395833333336 | 9.63 |
| 44634.40625 | 9.64 |
| 44634.416666666664 | 9.64 |
| 44634.427083333336 | 9.65 |
| 44634.4375 | 9.69 |
| 44634.447916666664 | 9.7 |
| 44634.458333333336 | 9.7 |
| 44634.46875 | 9.66 |
| 44634.479166666664 | 9.66 |
| 44634.489583333336 | 9.63 |
| 44634.5 | 9.63 |
| 44634.510416666664 | 9.55 |
| 44634.520833333336 | 9.6 |
| 44634.53125 | 9.63 |
| 44634.541666666664 | 9.79 |
| 44634.552083333336 | 9.88 |
| 44634.5625 | 10.09 |
| 44634.572916666664 | 10.07 |
| 44634.583333333336 | 10.05 |
| 44634.59375 | 10.41 |
| 44634.604166666664 | 10.45 |
| 44634.614583333336 | 10.4 |
| 44634.625 | 10.46 |
| 44634.635416666664 | 10.48 |
| 44634.645833333336 | 10.52 |
| 44634.65625 | 10.48 |
| 44634.666666666664 | 10.46 |
| 44634.677083333336 | 10.43 |
| 44634.6875 | 10.38 |
| 44634.697916666664 | 10.4 |
| 44634.708333333336 | 10.47 |
| 44634.71875 | 10.5 |
| 44634.729166666664 | 10.47 |
| 44634.739583333336 | 10.51 |
| 44634.75 | 10.4 |
| 44634.760416666664 | 10.43 |
| 44634.770833333336 | 10.44 |
| 44634.78125 | 10.4 |
| 44634.791666666664 | 10.48 |
| 44634.802083333336 | 10.48 |
| 44634.8125 | 10.49 |
| 44634.822916666664 | 10.63 |
| 44634.833333333336 | 10.63 |
| 44634.84375 | 10.6 |
| 44634.854166666664 | 10.67 |
| 44634.864583333336 | 10.7 |
| 44634.875 | 10.67 |
| 44634.885416666664 | 10.65 |
| 44634.895833333336 | 10.63 |
| 44634.90625 | 10.58 |
| 44634.916666666664 | 10.54 |
| 44634.927083333336 | 10.49 |
| 44634.9375 | 10.43 |
| 44634.947916666664 | 10.38 |
| 44634.958333333336 | 10.32 |
| 44634.96875 | 10.25 |
| 44634.979166666664 | 10.21 |
| 44634.989583333336 | 10.26 |
| 44635.0 | 10.31 |
| 44635.010416666664 | 10.24 |
| 44635.020833333336 | 10.23 |
| 44635.03125 | 10.22 |
| 44635.041666666664 | 10.25 |
| 44635.052083333336 | 10.19 |
| 44635.0625 | 10.27 |
| 44635.072916666664 | 10.34 |
| 44635.083333333336 | 10.31 |
| 44635.09375 | 10.3 |
| 44635.104166666664 | 10.33 |
| 44635.114583333336 | 10.36 |
| 44635.125 | 10.34 |
| 44635.135416666664 | 10.31 |
| 44635.145833333336 | 10.3 |
| 44635.15625 | 10.32 |
| 44635.166666666664 | 10.27 |
| 44635.177083333336 | 10.25 |
| 44635.1875 | 10.27 |
| 44635.197916666664 | 10.22 |
| 44635.208333333336 | 10.22 |
| 44635.21875 | 10.15 |
| 44635.229166666664 | 10.04 |
| 44635.239583333336 | 10.07 |
| 44635.25 | 10.08 |
| 44635.260416666664 | 10.07 |
| 44635.270833333336 | 9.96 |
| 44635.28125 | 9.95 |
| 44635.291666666664 | 9.85 |
| 44635.302083333336 | 9.77 |
| 44635.3125 | 9.69 |
| 44635.322916666664 | 9.61 |
| 44635.333333333336 | 9.53 |
| 44635.34375 | 9.43 |
| 44635.354166666664 | 9.32 |
| 44635.364583333336 | 9.26 |
| 44635.375 | 9.21 |
| 44635.385416666664 | 9.2 |
| 44635.395833333336 | 9.21 |
| 44635.40625 | 9.23 |
| 44635.416666666664 | 9.24 |
| 44635.427083333336 | 9.27 |
| 44635.4375 | 9.31 |
| 44635.447916666664 | 9.34 |
| 44635.458333333336 | 9.36 |
| 44635.46875 | 9.35 |
| 44635.479166666664 | 9.34 |
| 44635.489583333336 | 9.37 |
| 44635.5 | 9.29 |
| 44635.510416666664 | 9.35 |
| 44635.520833333336 | 9.3 |
| 44635.53125 | 9.31 |
| 44635.541666666664 | 9.29 |
| 44635.552083333336 | 9.37 |
| 44635.5625 | 9.39 |
| 44635.572916666664 | 9.39 |
| 44635.583333333336 | 9.33 |
| 44635.59375 | 9.38 |
| 44635.604166666664 | 9.4 |
| 44635.614583333336 | 9.45 |
| 44635.625 | 9.52 |
| 44635.635416666664 | 9.58 |
| 44635.645833333336 | 9.62 |
| 44635.65625 | 9.67 |
| 44635.666666666664 | 9.71 |
| 44635.677083333336 | 9.74 |
| 44635.6875 | 9.77 |
| 44635.697916666664 | 9.8 |
| 44635.708333333336 | 9.83 |
| 44635.71875 | 9.85 |
| 44635.729166666664 | 9.9 |
| 44635.739583333336 | 9.89 |
| 44635.75 | 9.9 |
| 44635.760416666664 | 9.89 |
| 44635.770833333336 | 9.9 |
| 44635.78125 | 9.9 |
| 44635.791666666664 | 9.95 |
| 44635.802083333336 | 10.03 |
| 44635.8125 | 10.1 |
| 44635.822916666664 | 10.17 |
| 44635.833333333336 | 10.25 |
| 44635.84375 | 10.24 |
| 44635.854166666664 | 10.23 |
| 44635.864583333336 | 10.21 |
| 44635.875 | 10.15 |
| 44635.885416666664 | 10.08 |
| 44635.895833333336 | 10.04 |
| 44635.90625 | 10.01 |
| 44635.916666666664 | 9.98 |
| 44635.927083333336 | 9.95 |
| 44635.9375 | 9.94 |
| 44635.947916666664 | 9.93 |
| 44635.958333333336 | 9.9 |
| 44635.96875 | 9.87 |
| 44635.979166666664 | 9.85 |
| 44635.989583333336 | 9.84 |
| 44636.0 | 9.79 |
| 44636.010416666664 | 9.81 |
| 44636.020833333336 | 9.81 |
| 44636.03125 | 9.83 |
| 44636.041666666664 | 9.79 |
| 44636.052083333336 | 9.74 |
| 44636.0625 | 9.6 |
| 44636.072916666664 | 9.53 |
| 44636.083333333336 | 9.51 |
| 44636.09375 | 9.38 |
| 44636.104166666664 | 9.46 |
| 44636.114583333336 | 9.38 |
| 44636.125 | 9.39 |
| 44636.135416666664 | 9.42 |
| 44636.145833333336 | 9.47 |
| 44636.15625 | 9.47 |
| 44636.166666666664 | 9.45 |
| 44636.177083333336 | 9.41 |
| 44636.1875 | 9.37 |
| 44636.197916666664 | 9.35 |
| 44636.208333333336 | 9.31 |
| 44636.21875 | 9.29 |
| 44636.229166666664 | 9.27 |
| 44636.239583333336 | 9.26 |
| 44636.25 | 9.23 |
| 44636.260416666664 | 9.22 |
| 44636.270833333336 | 9.19 |
| 44636.28125 | 9.2 |
| 44636.291666666664 | 9.17 |
| 44636.302083333336 | 9.19 |
| 44636.3125 | 9.16 |
| 44636.322916666664 | 9.12 |
| 44636.333333333336 | 9.07 |
| 44636.34375 | 9.02 |
| 44636.354166666664 | 8.98 |
| 44636.364583333336 | 8.93 |
| 44636.375 | 8.89 |
| 44636.385416666664 | 8.84 |
| 44636.395833333336 | 8.81 |
| 44636.40625 | 8.8 |
| 44636.416666666664 | 8.8 |
| 44636.427083333336 | 8.82 |
| 44636.4375 | 8.83 |
| 44636.447916666664 | 8.84 |
| 44636.458333333336 | 8.89 |
| 44636.46875 | 8.95 |
| 44636.479166666664 | 8.97 |
| 44636.489583333336 | 8.98 |
| 44636.5 | 9 |
| 44636.510416666664 | 9 |
| 44636.520833333336 | 8.98 |
| 44636.53125 | 9.01 |
| 44636.541666666664 | 9.01 |
| 44636.552083333336 | 9 |
| 44636.5625 | 8.97 |
| 44636.572916666664 | 8.95 |
| 44636.583333333336 | 8.98 |
| 44636.59375 | 8.99 |
| 44636.604166666664 | 8.99 |
| 44636.614583333336 | 8.91 |
| 44636.625 | 8.95 |
| 44636.635416666664 | 8.89 |
| 44636.645833333336 | 8.91 |
| 44636.65625 | 8.92 |
| 44636.666666666664 | 8.96 |
| 44636.677083333336 | 8.98 |
| 44636.6875 | 9 |
| 44636.697916666664 | 9.02 |
| 44636.708333333336 | 9.03 |
| 44636.71875 | 9.05 |
| 44636.729166666664 | 9.08 |
| 44636.739583333336 | 9.07 |
| 44636.75 | 9.11 |
| 44636.760416666664 | 9.15 |
| 44636.770833333336 | 9.12 |
| 44636.78125 | 9.18 |
| 44636.791666666664 | 9.2 |
| 44636.802083333336 | 9.18 |
| 44636.8125 | 9.15 |
| 44636.822916666664 | 9.2 |
| 44636.833333333336 | 9.29 |
| 44636.84375 | 9.38 |
| 44636.854166666664 | 9.51 |
| 44636.864583333336 | 9.67 |
| 44636.875 | 9.75 |
| 44636.885416666664 | 9.75 |
| 44636.895833333336 | 9.79 |
| 44636.90625 | 9.8 |
| 44636.916666666664 | 9.78 |
| 44636.927083333336 | 9.71 |
| 44636.9375 | 9.64 |
| 44636.947916666664 | 9.59 |
| 44636.958333333336 | 9.56 |
| 44636.96875 | 9.56 |
| 44636.979166666664 | 9.56 |
| 44636.989583333336 | 9.52 |
| 44637.0 | 9.49 |
| 44637.010416666664 | 9.47 |
| 44637.020833333336 | 9.44 |
| 44637.03125 | 9.43 |
| 44637.041666666664 | 9.42 |
| 44637.052083333336 | 9.41 |
| 44637.0625 | 9.38 |
| 44637.072916666664 | 9.32 |
| 44637.083333333336 | 9.29 |
| 44637.09375 | 9.29 |
| 44637.104166666664 | 9.27 |
| 44637.114583333336 | 9.12 |
| 44637.125 | 9.02 |
| 44637.135416666664 | 9 |
| 44637.145833333336 | 8.89 |
| 44637.15625 | 8.83 |
| 44637.166666666664 | 8.78 |
| 44637.177083333336 | 8.75 |
| 44637.1875 | 8.72 |
| 44637.197916666664 | 8.78 |
| 44637.208333333336 | 8.72 |
| 44637.21875 | 8.72 |
| 44637.229166666664 | 8.68 |
| 44637.239583333336 | 8.68 |
| 44637.25 | 8.66 |
| 44637.260416666664 | 8.63 |
| 44637.270833333336 | 8.6 |
| 44637.28125 | 8.6 |
| 44637.291666666664 | 8.59 |
| 44637.302083333336 | 8.54 |
| 44637.3125 | 8.53 |
| 44637.322916666664 | 8.51 |
| 44637.333333333336 | 8.55 |
| 44637.34375 | 8.57 |
| 44637.354166666664 | 8.59 |
| 44637.364583333336 | 8.57 |
| 44637.375 | 8.53 |
| 44637.385416666664 | 8.51 |
| 44637.395833333336 | 8.47 |
| 44637.40625 | 8.45 |
| 44637.416666666664 | 8.43 |
| 44637.427083333336 | 8.43 |
| 44637.4375 | 8.44 |
| 44637.447916666664 | 8.46 |
| 44637.458333333336 | 8.5 |
| 44637.46875 | 8.53 |
| 44637.479166666664 | 8.56 |
| 44637.489583333336 | 8.59 |
| 44637.5 | 8.63 |
| 44637.510416666664 | 8.66 |
| 44637.520833333336 | 8.67 |
| 44637.53125 | 8.69 |
| 44637.541666666664 | 8.75 |
| 44637.552083333336 | 8.68 |
| 44637.5625 | 8.67 |
| 44637.572916666664 | 8.82 |
| 44637.583333333336 | 8.76 |
| 44637.59375 | 8.67 |
| 44637.604166666664 | 8.71 |
| 44637.614583333336 | 8.62 |
| 44637.625 | 8.64 |
| 44637.635416666664 | 8.64 |
| 44637.645833333336 | 8.61 |
| 44637.65625 | 8.59 |
| 44637.666666666664 | 8.58 |
| 44637.677083333336 | 8.61 |
| 44637.6875 | 8.62 |
| 44637.697916666664 | 8.63 |
| 44637.708333333336 | 8.67 |
| 44637.71875 | 8.62 |
| 44637.729166666664 | 8.66 |
| 44637.739583333336 | 8.66 |
| 44637.75 | 8.68 |
| 44637.760416666664 | 8.68 |
| 44637.770833333336 | 8.68 |
| 44637.78125 | 8.7 |
| 44637.791666666664 | 8.71 |
| 44637.802083333336 | 8.73 |
| 44637.8125 | 8.75 |
| 44637.822916666664 | 8.69 |
| 44637.833333333336 | 8.63 |
| 44637.84375 | 8.58 |
| 44637.854166666664 | 8.64 |
| 44637.864583333336 | 8.71 |
| 44637.875 | 8.79 |
| 44637.885416666664 | 8.93 |
| 44637.895833333336 | 9.01 |
| 44637.90625 | 9.03 |
| 44637.916666666664 | 8.99 |
| 44637.927083333336 | 8.98 |
| 44637.9375 | 8.97 |
| 44637.947916666664 | 8.95 |
| 44637.958333333336 | 8.95 |
| 44637.96875 | 8.93 |
| 44637.979166666664 | 8.91 |
| 44637.989583333336 | 8.89 |
| 44638.0 | 8.88 |
| 44638.010416666664 | 8.89 |
| 44638.020833333336 | 8.89 |
| 44638.03125 | 8.89 |
| 44638.041666666664 | 8.86 |
| 44638.052083333336 | 8.87 |
| 44638.0625 | 8.85 |
| 44638.072916666664 | 8.83 |
| 44638.083333333336 | 8.83 |
| 44638.09375 | 8.8 |
| 44638.104166666664 | 8.7 |
| 44638.114583333336 | 8.64 |
| 44638.125 | 8.62 |
| 44638.135416666664 | 8.56 |
| 44638.145833333336 | 8.44 |
| 44638.15625 | 8.24 |
| 44638.166666666664 | 8.25 |
| 44638.177083333336 | 8.19 |
| 44638.1875 | 7.95 |
| 44638.197916666664 | 7.95 |
| 44638.208333333336 | 8.04 |
| 44638.21875 | 8.12 |
| 44638.229166666664 | 8.07 |
| 44638.239583333336 | 8.01 |
| 44638.25 | 7.95 |
| 44638.260416666664 | 7.9 |
| 44638.270833333336 | 7.83 |
| 44638.28125 | 7.79 |
| 44638.291666666664 | 7.73 |
| 44638.302083333336 | 7.69 |
| 44638.3125 | 7.66 |
| 44638.322916666664 | 7.66 |
| 44638.333333333336 | 7.7 |
| 44638.34375 | 7.68 |
| 44638.354166666664 | 7.7 |
| 44638.364583333336 | 7.77 |
| 44638.375 | 7.83 |
| 44638.385416666664 | 7.87 |
| 44638.395833333336 | 7.89 |
| 44638.40625 | 7.87 |
| 44638.416666666664 | 7.86 |
| 44638.427083333336 | 7.85 |
| 44638.4375 | 7.82 |
| 44638.447916666664 | 7.81 |
| 44638.458333333336 | 7.82 |
| 44638.46875 | 7.86 |
| 44638.479166666664 | 7.92 |
| 44638.489583333336 | 8.01 |
| 44638.5 | 8.07 |
| 44638.510416666664 | 8.12 |
| 44638.520833333336 | 8.14 |
| 44638.53125 | 8.15 |
| 44638.541666666664 | 8.16 |
| 44638.552083333336 | 8.18 |
| 44638.5625 | 8.17 |
| 44638.572916666664 | 8.17 |
| 44638.583333333336 | 8.16 |
| 44638.59375 | 8.17 |
| 44638.604166666664 | 8.16 |
| 44638.614583333336 | 8.19 |
| 44638.625 | 8.24 |
| 44638.635416666664 | 8.2 |
| 44638.645833333336 | 8.16 |
| 44638.65625 | 8.11 |
| 44638.666666666664 | 8.1 |
| 44638.677083333336 | 8.12 |
| 44638.6875 | 8.2 |
| 44638.697916666664 | 8.24 |
| 44638.708333333336 | 8.23 |
| 44638.71875 | 8.22 |
| 44638.729166666664 | 8.27 |
| 44638.739583333336 | 8.27 |
| 44638.75 | 8.38 |
| 44638.760416666664 | 8.34 |
| 44638.770833333336 | 8.3 |
| 44638.78125 | 8.32 |
| 44638.791666666664 | 8.33 |
| 44638.802083333336 | 8.35 |
| 44638.8125 | 8.38 |
| 44638.822916666664 | 8.4 |
| 44638.833333333336 | 8.4 |
| 44638.84375 | 8.34 |
| 44638.854166666664 | 8.3 |
| 44638.864583333336 | 8.21 |
| 44638.875 | 8.28 |
| 44638.885416666664 | 8.47 |
| 44638.895833333336 | 8.62 |
| 44638.90625 | 8.74 |
| 44638.916666666664 | 8.82 |
| 44638.927083333336 | 8.84 |
| 44638.9375 | 8.83 |
| 44638.947916666664 | 8.77 |
| 44638.958333333336 | 8.73 |
| 44638.96875 | 8.69 |
| 44638.979166666664 | 8.66 |
| 44638.989583333336 | 8.6 |
| 44639.0 | 8.56 |
| 44639.010416666664 | 8.54 |
| 44639.020833333336 | 8.51 |
| 44639.03125 | 8.47 |
| 44639.041666666664 | 8.44 |
| 44639.052083333336 | 8.41 |
| 44639.0625 | 8.38 |
| 44639.072916666664 | 8.35 |
| 44639.083333333336 | 8.32 |
| 44639.09375 | 8.33 |
| 44639.104166666664 | 8.31 |
| 44639.114583333336 | 8.3 |
| 44639.125 | 8.3 |
| 44639.135416666664 | 8.26 |
| 44639.145833333336 | 8.18 |
| 44639.15625 | 8.11 |
| 44639.166666666664 | 8.02 |
| 44639.177083333336 | 8 |
| 44639.1875 | 7.95 |
| 44639.197916666664 | 7.84 |
| 44639.208333333336 | 7.7 |
| 44639.21875 | 7.67 |
| 44639.229166666664 | 7.6 |
| 44639.239583333336 | 7.56 |
| 44639.25 | 7.61 |
| 44639.260416666664 | 7.73 |
| 44639.270833333336 | 7.7 |
| 44639.28125 | 7.64 |
| 44639.291666666664 | 7.52 |
| 44639.302083333336 | 7.46 |
| 44639.3125 | 7.38 |
| 44639.322916666664 | 7.33 |
| 44639.333333333336 | 7.34 |
| 44639.34375 | 7.34 |
| 44639.354166666664 | 7.32 |
| 44639.364583333336 | 7.31 |
| 44639.375 | 7.31 |
| 44639.385416666664 | 7.37 |
| 44639.395833333336 | 7.43 |
| 44639.40625 | 7.47 |
| 44639.416666666664 | 7.44 |
| 44639.427083333336 | 7.43 |
| 44639.4375 | 7.41 |
| 44639.447916666664 | 7.39 |
| 44639.458333333336 | 7.36 |
| 44639.46875 | 7.34 |
| 44639.479166666664 | 7.37 |
| 44639.489583333336 | 7.43 |
| 44639.5 | 7.5 |
| 44639.510416666664 | 7.56 |
| 44639.520833333336 | 7.6 |
| 44639.53125 | 7.64 |
| 44639.541666666664 | 7.66 |
| 44639.552083333336 | 7.67 |
| 44639.5625 | 7.68 |
| 44639.572916666664 | 7.7 |
| 44639.583333333336 | 7.71 |
| 44639.59375 | 7.72 |
| 44639.604166666664 | 7.73 |
| 44639.614583333336 | 7.65 |
| 44639.625 | 7.7 |
| 44639.635416666664 | 7.81 |
| 44639.645833333336 | 7.88 |
| 44639.65625 | 7.99 |
| 44639.666666666664 | 8.08 |
| 44639.677083333336 | 8.13 |
| 44639.6875 | 8.17 |
| 44639.697916666664 | 8.17 |
| 44639.708333333336 | 8.3 |
| 44639.71875 | 8.35 |
| 44639.729166666664 | 8.33 |
| 44639.739583333336 | 8.26 |
| 44639.75 | 8.28 |
| 44639.760416666664 | 8.28 |
| 44639.770833333336 | 8.27 |
| 44639.78125 | 8.28 |
| 44639.791666666664 | 8.26 |
| 44639.802083333336 | 8.28 |
| 44639.8125 | 8.31 |
| 44639.822916666664 | 8.31 |
| 44639.833333333336 | 8.32 |
| 44639.84375 | 8.32 |
| 44639.854166666664 | 8.3 |
| 44639.864583333336 | 8.28 |
| 44639.875 | 8.21 |
| 44639.885416666664 | 8.15 |
| 44639.895833333336 | 8.2 |
| 44639.90625 | 8.29 |
| 44639.916666666664 | 8.36 |
| 44639.927083333336 | 8.35 |
| 44639.9375 | 8.32 |
| 44639.947916666664 | 8.26 |
| 44639.958333333336 | 8.19 |
| 44639.96875 | 8.09 |
| 44639.979166666664 | 8.01 |
| 44639.989583333336 | 7.95 |
| 44640.0 | 7.95 |
| 44640.010416666664 | 7.95 |
| 44640.020833333336 | 7.99 |
| 44640.03125 | 7.98 |
| 44640.041666666664 | 7.99 |
| 44640.052083333336 | 7.97 |
| 44640.0625 | 7.96 |
| 44640.072916666664 | 7.95 |
| 44640.083333333336 | 7.94 |
| 44640.09375 | 7.93 |
| 44640.104166666664 | 7.91 |
| 44640.114583333336 | 7.91 |
| 44640.125 | 7.89 |
| 44640.135416666664 | 7.81 |
| 44640.145833333336 | 7.84 |
| 44640.15625 | 7.81 |
| 44640.166666666664 | 7.73 |
| 44640.177083333336 | 7.56 |
| 44640.1875 | 7.58 |
| 44640.197916666664 | 7.51 |
| 44640.208333333336 | 7.44 |
| 44640.21875 | 7.29 |
| 44640.229166666664 | 7.1 |
| 44640.239583333336 | 6.88 |
| 44640.25 | 6.94 |
| 44640.260416666664 | 7.19 |
| 44640.270833333336 | 7.24 |
| 44640.28125 | 7.15 |
| 44640.291666666664 | 7.08 |
| 44640.302083333336 | 7.07 |
| 44640.3125 | 7 |
| 44640.322916666664 | 6.97 |
| 44640.333333333336 | 6.89 |
| 44640.34375 | 6.86 |
| 44640.354166666664 | 6.82 |
| 44640.364583333336 | 6.75 |
| 44640.375 | 6.81 |
| 44640.385416666664 | 6.79 |
| 44640.395833333336 | 6.75 |
| 44640.40625 | 6.73 |
| 44640.416666666664 | 6.78 |
| 44640.427083333336 | 6.84 |
| 44640.4375 | 6.91 |
| 44640.447916666664 | 6.94 |
| 44640.458333333336 | 6.93 |
| 44640.46875 | 6.91 |
| 44640.479166666664 | 6.91 |
| 44640.489583333336 | 6.9 |
| 44640.5 | 6.92 |
| 44640.510416666664 | 6.97 |
| 44640.520833333336 | 7.04 |
| 44640.53125 | 7.13 |
| 44640.541666666664 | 7.2 |
| 44640.552083333336 | 7.28 |
| 44640.5625 | 7.36 |
| 44640.572916666664 | 7.43 |
| 44640.583333333336 | 7.49 |
| 44640.59375 | 7.54 |
| 44640.604166666664 | 7.58 |
| 44640.614583333336 | 7.6 |
| 44640.625 | 7.63 |
| 44640.635416666664 | 7.63 |
| 44640.645833333336 | 7.66 |
| 44640.65625 | 7.67 |
| 44640.666666666664 | 7.73 |
| 44640.677083333336 | 7.8 |
| 44640.6875 | 7.87 |
| 44640.697916666664 | 7.85 |
| 44640.708333333336 | 7.97 |
| 44640.71875 | 8.08 |
| 44640.729166666664 | 8.11 |
| 44640.739583333336 | 8.17 |
| 44640.75 | 8.13 |
| 44640.760416666664 | 8.05 |
| 44640.770833333336 | 8.17 |
| 44640.78125 | 8.27 |
| 44640.791666666664 | 8.28 |
| 44640.802083333336 | 8.27 |
| 44640.8125 | 8.28 |
| 44640.822916666664 | 8.26 |
| 44640.833333333336 | 8.26 |
| 44640.84375 | 8.26 |
| 44640.854166666664 | 8.25 |
| 44640.864583333336 | 8.24 |
| 44640.875 | 8.22 |
| 44640.885416666664 | 8.22 |
| 44640.895833333336 | 8.21 |
| 44640.90625 | 8.15 |
| 44640.916666666664 | 8.07 |
| 44640.927083333336 | 8.03 |
| 44640.9375 | 8.15 |
| 44640.947916666664 | 8.38 |
| 44640.958333333336 | 8.42 |
| 44640.96875 | 8.42 |
| 44640.979166666664 | 8.44 |
| 44640.989583333336 | 8.4 |
| 44641.0 | 8.34 |
| 44641.010416666664 | 8.26 |
| 44641.020833333336 | 8.2 |
| 44641.03125 | 8.15 |
| 44641.041666666664 | 8.11 |
| 44641.052083333336 | 8.08 |
| 44641.0625 | 8.06 |
| 44641.072916666664 | 8.06 |
| 44641.083333333336 | 8.06 |
| 44641.09375 | 8.07 |
| 44641.104166666664 | 8.08 |
| 44641.114583333336 | 8.08 |
| 44641.125 | 8.08 |
| 44641.135416666664 | 8.08 |
| 44641.145833333336 | 8.07 |
| 44641.15625 | 8.06 |
| 44641.166666666664 | 7.97 |
| 44641.177083333336 | 8.01 |
| 44641.1875 | 8.02 |
| 44641.197916666664 | 7.98 |
| 44641.208333333336 | 7.91 |
| 44641.21875 | 7.87 |
| 44641.229166666664 | 7.8 |
| 44641.239583333336 | 7.8 |
| 44641.25 | 7.68 |
| 44641.260416666664 | 7.55 |
| 44641.270833333336 | 7.56 |
| 44641.28125 | 7.56 |
| 44641.291666666664 | 7.73 |
| 44641.302083333336 | 7.8 |
| 44641.3125 | 7.8 |
| 44641.322916666664 | 7.84 |
| 44641.333333333336 | 7.82 |
| 44641.34375 | 7.88 |
| 44641.354166666664 | 7.82 |
| 44641.364583333336 | 7.8 |
| 44641.375 | 7.78 |
| 44641.385416666664 | 7.77 |
| 44641.395833333336 | 7.76 |
| 44641.40625 | 7.77 |
| 44641.416666666664 | 7.75 |
| 44641.427083333336 | 7.76 |
| 44641.4375 | 7.73 |
| 44641.447916666664 | 7.7 |
| 44641.458333333336 | 7.7 |
| 44641.46875 | 7.69 |
| 44641.479166666664 | 7.7 |
| 44641.489583333336 | 7.68 |
| 44641.5 | 7.65 |
| 44641.510416666664 | 7.62 |
| 44641.520833333336 | 7.6 |
| 44641.53125 | 7.57 |
| 44641.541666666664 | 7.58 |
| 44641.552083333336 | 7.61 |
| 44641.5625 | 7.67 |
| 44641.572916666664 | 7.75 |
| 44641.583333333336 | 7.81 |
| 44641.59375 | 7.91 |
| 44641.604166666664 | 8.01 |
| 44641.614583333336 | 8.08 |
| 44641.625 | 8.13 |
| 44641.635416666664 | 8.17 |
| 44641.645833333336 | 8.2 |
| 44641.65625 | 8.22 |
| 44641.666666666664 | 8.25 |
| 44641.677083333336 | 8.27 |
| 44641.6875 | 8.34 |
| 44641.697916666664 | 8.43 |
| 44641.708333333336 | 8.46 |
| 44641.71875 | 8.53 |
| 44641.729166666664 | 8.6 |
| 44641.739583333336 | 8.69 |
| 44641.75 | 8.76 |
| 44641.760416666664 | 8.71 |
| 44641.770833333336 | 8.77 |
| 44641.78125 | 8.77 |
| 44641.791666666664 | 8.82 |
| 44641.802083333336 | 8.92 |
| 44641.8125 | 8.99 |
| 44641.822916666664 | 9.03 |
| 44641.833333333336 | 9.11 |
| 44641.84375 | 9.12 |
| 44641.854166666664 | 9.12 |
| 44641.864583333336 | 9.14 |
| 44641.875 | 9.14 |
| 44641.885416666664 | 9.16 |
| 44641.895833333336 | 9.16 |
| 44641.90625 | 9.15 |
| 44641.916666666664 | 9.14 |
| 44641.927083333336 | 9.08 |
| 44641.9375 | 8.97 |
| 44641.947916666664 | 8.97 |
| 44641.958333333336 | 9.01 |
| 44641.96875 | 9.15 |
| 44641.979166666664 | 9.23 |
| 44641.989583333336 | 9.22 |
| 44642.0 | 9.22 |
| 44642.010416666664 | 9.13 |
| 44642.020833333336 | 8.99 |
| 44642.03125 | 8.82 |
| 44642.041666666664 | 8.71 |
| 44642.052083333336 | 8.63 |
| 44642.0625 | 8.55 |
| 44642.072916666664 | 8.52 |
| 44642.083333333336 | 8.49 |
| 44642.09375 | 8.47 |
| 44642.104166666664 | 8.45 |
| 44642.114583333336 | 8.44 |
| 44642.125 | 8.43 |
| 44642.135416666664 | 8.42 |
| 44642.145833333336 | 8.42 |
| 44642.15625 | 8.41 |
| 44642.166666666664 | 8.39 |
| 44642.177083333336 | 8.37 |
| 44642.1875 | 8.3 |
| 44642.197916666664 | 8.35 |
| 44642.208333333336 | 8.34 |
| 44642.21875 | 8.3 |
| 44642.229166666664 | 8.21 |
| 44642.239583333336 | 8.12 |
| 44642.25 | 8.01 |
| 44642.260416666664 | 7.91 |
| 44642.270833333336 | 7.81 |
| 44642.28125 | 7.72 |
| 44642.291666666664 | 7.64 |
| 44642.302083333336 | 7.65 |
| 44642.3125 | 7.69 |
| 44642.322916666664 | 7.92 |
| 44642.333333333336 | 8.03 |
| 44642.34375 | 8.05 |
| 44642.354166666664 | 8 |
| 44642.364583333336 | 8.03 |
| 44642.375 | 8.07 |
| 44642.385416666664 | 7.98 |
| 44642.395833333336 | 7.92 |
| 44642.40625 | 7.87 |
| 44642.416666666664 | 7.84 |
| 44642.427083333336 | 7.79 |
| 44642.4375 | 7.8 |
| 44642.447916666664 | 7.79 |
| 44642.458333333336 | 7.79 |
| 44642.46875 | 7.8 |
| 44642.479166666664 | 7.8 |
| 44642.489583333336 | 7.79 |
| 44642.5 | 7.82 |
| 44642.510416666664 | 7.84 |
| 44642.520833333336 | 7.83 |
| 44642.53125 | 7.81 |
| 44642.541666666664 | 7.79 |
| 44642.552083333336 | 7.77 |
| 44642.5625 | 7.76 |
| 44642.572916666664 | 7.76 |
| 44642.583333333336 | 7.78 |
| 44642.59375 | 7.81 |
| 44642.604166666664 | 7.87 |
| 44642.614583333336 | 7.94 |
| 44642.625 | 8.02 |
| 44642.635416666664 | 8.09 |
| 44642.645833333336 | 8.15 |
| 44642.65625 | 8.19 |
| 44642.666666666664 | 8.22 |
| 44642.677083333336 | 8.28 |
| 44642.6875 | 8.3 |
| 44642.697916666664 | 8.3 |
| 44642.708333333336 | 8.36 |
| 44642.71875 | 8.5 |
| 44642.729166666664 | 8.64 |
| 44642.739583333336 | 8.63 |
| 44642.75 | 8.69 |
| 44642.760416666664 | 8.74 |
| 44642.770833333336 | 8.87 |
| 44642.78125 | 8.83 |
| 44642.791666666664 | 8.81 |
| 44642.802083333336 | 8.85 |
| 44642.8125 | 8.88 |
| 44642.822916666664 | 8.96 |
| 44642.833333333336 | 9.03 |
| 44642.84375 | 9.06 |
| 44642.854166666664 | 9.1 |
| 44642.864583333336 | 9.1 |
| 44642.875 | 9.09 |
| 44642.885416666664 | 9.05 |
| 44642.895833333336 | 9.02 |
| 44642.90625 | 9.02 |
| 44642.916666666664 | 9.02 |
| 44642.927083333336 | 9.02 |
| 44642.9375 | 8.97 |
| 44642.947916666664 | 8.97 |
| 44642.958333333336 | 8.85 |
| 44642.96875 | 8.83 |
| 44642.979166666664 | 8.75 |
| 44642.989583333336 | 8.75 |
| 44643.0 | 8.86 |
| 44643.010416666664 | 8.9 |
| 44643.020833333336 | 8.93 |
| 44643.03125 | 8.92 |
| 44643.041666666664 | 8.87 |
| 44643.052083333336 | 8.79 |
| 44643.0625 | 8.75 |
| 44643.072916666664 | 8.64 |
| 44643.083333333336 | 8.56 |
| 44643.09375 | 8.5 |
| 44643.104166666664 | 8.47 |
| 44643.114583333336 | 8.44 |
| 44643.125 | 8.39 |
| 44643.135416666664 | 8.35 |
| 44643.145833333336 | 8.33 |
| 44643.15625 | 8.31 |
| 44643.166666666664 | 8.29 |
| 44643.177083333336 | 8.28 |
| 44643.1875 | 8.28 |
| 44643.197916666664 | 8.26 |
| 44643.208333333336 | 8.26 |
| 44643.21875 | 8.22 |
| 44643.229166666664 | 8.21 |
| 44643.239583333336 | 8.2 |
| 44643.25 | 8.16 |
| 44643.260416666664 | 8.1 |
| 44643.270833333336 | 8.02 |
| 44643.28125 | 7.95 |
| 44643.291666666664 | 7.93 |
| 44643.302083333336 | 7.91 |
| 44643.3125 | 7.72 |
| 44643.322916666664 | 7.59 |
| 44643.333333333336 | 7.47 |
| 44643.34375 | 7.46 |
| 44643.354166666664 | 7.65 |
| 44643.364583333336 | 7.81 |
| 44643.375 | 7.88 |
| 44643.385416666664 | 7.85 |
| 44643.395833333336 | 7.76 |
| 44643.40625 | 7.74 |
| 44643.416666666664 | 7.75 |
| 44643.427083333336 | 7.73 |
| 44643.4375 | 7.68 |
| 44643.447916666664 | 7.64 |
| 44643.458333333336 | 7.62 |
| 44643.46875 | 7.6 |
| 44643.479166666664 | 7.57 |
| 44643.489583333336 | 7.64 |
| 44643.5 | 7.57 |
| 44643.510416666664 | 7.59 |
| 44643.520833333336 | 7.59 |
| 44643.53125 | 7.61 |
| 44643.541666666664 | 7.64 |
| 44643.552083333336 | 7.63 |
| 44643.5625 | 7.61 |
| 44643.572916666664 | 7.64 |
| 44643.583333333336 | 7.68 |
| 44643.59375 | 7.71 |
| 44643.604166666664 | 7.73 |
| 44643.614583333336 | 7.75 |
| 44643.625 | 7.77 |
| 44643.635416666664 | 7.81 |
| 44643.645833333336 | 7.86 |
| 44643.65625 | 7.89 |
| 44643.666666666664 | 7.92 |
| 44643.677083333336 | 7.95 |
| 44643.6875 | 7.97 |
| 44643.697916666664 | 8.01 |
| 44643.708333333336 | 8.07 |
| 44643.71875 | 8.09 |
| 44643.729166666664 | 8.12 |
| 44643.739583333336 | 8.15 |
| 44643.75 | 8.18 |
| 44643.760416666664 | 8.24 |
| 44643.770833333336 | 8.3 |
| 44643.78125 | 8.27 |
| 44643.791666666664 | 8.26 |
| 44643.802083333336 | 8.24 |
| 44643.8125 | 8.28 |
| 44643.822916666664 | 8.28 |
| 44643.833333333336 | 8.36 |
| 44643.84375 | 8.47 |
| 44643.854166666664 | 8.55 |
| 44643.864583333336 | 8.6 |
| 44643.875 | 8.61 |
| 44643.885416666664 | 8.63 |
| 44643.895833333336 | 8.61 |
| 44643.90625 | 8.61 |
| 44643.916666666664 | 8.58 |
| 44643.927083333336 | 8.57 |
| 44643.9375 | 8.56 |
| 44643.947916666664 | 8.54 |
| 44643.958333333336 | 8.54 |
| 44643.96875 | 8.52 |
| 44643.979166666664 | 8.47 |
| 44643.989583333336 | 8.45 |
| 44644.0 | 8.41 |
| 44644.010416666664 | 8.36 |
| 44644.020833333336 | 8.41 |
| 44644.03125 | 8.42 |
| 44644.041666666664 | 8.4 |
| 44644.052083333336 | 8.28 |
| 44644.0625 | 8.24 |
| 44644.072916666664 | 8.21 |
| 44644.083333333336 | 8.21 |
| 44644.09375 | 8.18 |
| 44644.104166666664 | 8.17 |
| 44644.114583333336 | 8.14 |
| 44644.125 | 8.14 |
| 44644.135416666664 | 8.13 |
| 44644.145833333336 | 8.12 |
| 44644.15625 | 8.11 |
| 44644.166666666664 | 8.11 |
| 44644.177083333336 | 8.11 |
| 44644.1875 | 8.1 |
| 44644.197916666664 | 8.09 |
| 44644.208333333336 | 8.09 |
| 44644.21875 | 8.08 |
| 44644.229166666664 | 8.07 |
| 44644.239583333336 | 8.06 |
| 44644.25 | 8.06 |
| 44644.260416666664 | 8.04 |
| 44644.270833333336 | 8.01 |
| 44644.28125 | 7.99 |
| 44644.291666666664 | 8 |
| 44644.302083333336 | 8.03 |
| 44644.3125 | 7.97 |
| 44644.322916666664 | 7.91 |
| 44644.333333333336 | 7.84 |
| 44644.34375 | 7.83 |
| 44644.354166666664 | 7.74 |
| 44644.364583333336 | 7.68 |
| 44644.375 | 7.65 |
| 44644.385416666664 | 7.59 |
| 44644.395833333336 | 7.52 |
| 44644.40625 | 7.31 |
| 44644.416666666664 | 7.26 |
| 44644.427083333336 | 7.26 |
| 44644.4375 | 7.39 |
| 44644.447916666664 | 7.46 |
| 44644.458333333336 | 7.6 |
| 44644.46875 | 7.61 |
| 44644.479166666664 | 7.7 |
| 44644.489583333336 | 7.73 |
| 44644.5 | 7.73 |
| 44644.510416666664 | 7.7 |
| 44644.520833333336 | 7.62 |
| 44644.53125 | 7.82 |
| 44644.541666666664 | 8.08 |
| 44644.552083333336 | 7.79 |
| 44644.5625 | 8.07 |
| 44644.572916666664 | 7.8 |
| 44644.583333333336 | 7.93 |
| 44644.59375 | 7.84 |
| 44644.604166666664 | 7.8 |
| 44644.614583333336 | 7.8 |
| 44644.625 | 7.68 |
| 44644.635416666664 | 7.69 |
| 44644.645833333336 | 7.72 |
| 44644.65625 | 7.74 |
| 44644.666666666664 | 7.74 |
| 44644.677083333336 | 7.93 |
| 44644.6875 | 7.96 |
| 44644.697916666664 | 7.93 |
| 44644.708333333336 | 7.94 |
| 44644.71875 | 7.91 |
| 44644.729166666664 | 7.95 |
| 44644.739583333336 | 7.91 |
| 44644.75 | 7.91 |
| 44644.760416666664 | 8.11 |
| 44644.770833333336 | 8.31 |
| 44644.78125 | 8.46 |
| 44644.791666666664 | 8.46 |
| 44644.802083333336 | 8.16 |
| 44644.8125 | 8.27 |
| 44644.822916666664 | 8.07 |
| 44644.833333333336 | 7.87 |
| 44644.84375 | 7.78 |
| 44644.854166666664 | 7.88 |
| 44644.864583333336 | 7.87 |
| 44644.875 | 7.71 |
| 44644.885416666664 | 7.83 |
| 44644.895833333336 | 7.74 |
| 44644.90625 | 7.75 |
| 44644.916666666664 | 7.65 |
| 44644.927083333336 | 7.54 |
| 44644.9375 | 7.51 |
| 44644.947916666664 | 7.45 |
| 44644.958333333336 | 7.41 |
| 44644.96875 | 7.41 |
| 44644.979166666664 | 7.37 |
| 44644.989583333336 | 7.4 |
| 44645.0 | 7.42 |
| 44645.010416666664 | 7.44 |
| 44645.020833333336 | 7.39 |
| 44645.03125 | 7.39 |
| 44645.041666666664 | 7.37 |
| 44645.052083333336 | 7.29 |
| 44645.0625 | 7.27 |
| 44645.072916666664 | 7.54 |
| 44645.083333333336 | 7.68 |
| 44645.09375 | 7.83 |
| 44645.104166666664 | 7.88 |
| 44645.114583333336 | 7.85 |
| 44645.125 | 7.82 |
| 44645.135416666664 | 7.78 |
| 44645.145833333336 | 7.71 |
| 44645.15625 | 7.7 |
| 44645.166666666664 | 7.67 |
| 44645.177083333336 | 7.67 |
| 44645.1875 | 7.69 |
| 44645.197916666664 | 7.71 |
| 44645.208333333336 | 7.73 |
| 44645.21875 | 7.74 |
| 44645.229166666664 | 7.71 |
| 44645.239583333336 | 7.67 |
| 44645.25 | 7.66 |
| 44645.260416666664 | 7.67 |
| 44645.270833333336 | 7.67 |
| 44645.28125 | 7.68 |
| 44645.291666666664 | 7.7 |
| 44645.302083333336 | 7.64 |
| 44645.3125 | 7.68 |
| 44645.322916666664 | 7.59 |
| 44645.333333333336 | 7.6 |
| 44645.34375 | 7.54 |
| 44645.354166666664 | 7.44 |
| 44645.364583333336 | 7.35 |
| 44645.375 | 7.29 |
| 44645.385416666664 | 7.17 |
| 44645.395833333336 | 7.17 |
| 44645.40625 | 7.21 |
| 44645.416666666664 | 7.25 |
| 44645.427083333336 | 7.16 |
| 44645.4375 | 7.2 |
| 44645.447916666664 | 7.08 |
| 44645.458333333336 | 7.04 |
| 44645.46875 | 6.99 |
| 44645.479166666664 | 6.88 |
| 44645.489583333336 | 6.79 |
| 44645.5 | 6.7 |
| 44645.510416666664 | 6.66 |
| 44645.520833333336 | 6.59 |
| 44645.53125 | 6.56 |
| 44645.541666666664 | 6.5 |
| 44645.552083333336 | 6.46 |
| 44645.5625 | 6.46 |
| 44645.572916666664 | 6.46 |
| 44645.583333333336 | 6.49 |
| 44645.59375 | 6.47 |
| 44645.604166666664 | 6.47 |
| 44645.614583333336 | 6.54 |
| 44645.625 | 6.52 |
| 44645.635416666664 | 6.58 |
| 44645.645833333336 | 6.55 |
| 44645.65625 | 6.67 |
| 44645.666666666664 | 6.68 |
| 44645.677083333336 | 6.73 |
| 44645.6875 | 6.84 |
| 44645.697916666664 | 7 |
| 44645.708333333336 | 7.1 |
| 44645.71875 | 7.12 |
| 44645.729166666664 | 7.15 |
| 44645.739583333336 | 7.17 |
| 44645.75 | 7.22 |
| 44645.760416666664 | 7.24 |
| 44645.770833333336 | 7.27 |
| 44645.78125 | 7.39 |
| 44645.791666666664 | 7.36 |
| 44645.802083333336 | 7.4 |
| 44645.8125 | 7.62 |
| 44645.822916666664 | 7.52 |
| 44645.833333333336 | 7.64 |
| 44645.84375 | 7.56 |
| 44645.854166666664 | 7.59 |
| 44645.864583333336 | 7.77 |
| 44645.875 | 7.86 |
| 44645.885416666664 | 7.97 |
| 44645.895833333336 | 7.78 |
| 44645.90625 | 7.69 |
| 44645.916666666664 | 7.69 |
| 44645.927083333336 | 7.89 |
| 44645.9375 | 7.73 |
| 44645.947916666664 | 7.64 |
| 44645.958333333336 | 7.57 |
| 44645.96875 | 7.53 |
| 44645.979166666664 | 7.5 |
| 44645.989583333336 | 7.46 |
| 44646.0 | 7.42 |
| 44646.010416666664 | 7.37 |
| 44646.020833333336 | 7.27 |
| 44646.03125 | 7.17 |
| 44646.041666666664 | 7.12 |
| 44646.052083333336 | 7.06 |
| 44646.0625 | 7.05 |
| 44646.072916666664 | 7 |
| 44646.083333333336 | 7 |
| 44646.09375 | 6.96 |
| 44646.104166666664 | 6.94 |
| 44646.114583333336 | 6.99 |
| 44646.125 | 7.06 |
| 44646.135416666664 | 7.15 |
| 44646.145833333336 | 7.3 |
| 44646.15625 | 7.34 |
| 44646.166666666664 | 7.32 |
| 44646.177083333336 | 7.31 |
| 44646.1875 | 7.3 |
| 44646.197916666664 | 7.32 |
| 44646.208333333336 | 7.33 |
| 44646.21875 | 7.34 |
| 44646.229166666664 | 7.32 |
| 44646.239583333336 | 7.32 |
| 44646.25 | 7.34 |
| 44646.260416666664 | 7.38 |
| 44646.270833333336 | 7.41 |
| 44646.28125 | 7.44 |
| 44646.291666666664 | 7.45 |
| 44646.302083333336 | 7.47 |
| 44646.3125 | 7.48 |
| 44646.322916666664 | 7.49 |
| 44646.333333333336 | 7.48 |
| 44646.34375 | 7.46 |
| 44646.354166666664 | 7.5 |
| 44646.364583333336 | 7.36 |
| 44646.375 | 7.42 |
| 44646.385416666664 | 7.41 |
| 44646.395833333336 | 7.33 |
| 44646.40625 | 7.28 |
| 44646.416666666664 | 7.13 |
| 44646.427083333336 | 7.03 |
| 44646.4375 | 6.85 |
| 44646.447916666664 | 6.87 |
| 44646.458333333336 | 6.91 |
| 44646.46875 | 6.95 |
| 44646.479166666664 | 6.93 |
| 44646.489583333336 | 6.94 |
| 44646.5 | 6.87 |
| 44646.510416666664 | 6.82 |
| 44646.520833333336 | 6.82 |
| 44646.53125 | 6.78 |
| 44646.541666666664 | 6.78 |
| 44646.552083333336 | 6.75 |
| 44646.5625 | 6.73 |
| 44646.572916666664 | 6.72 |
| 44646.583333333336 | 6.78 |
| 44646.59375 | 6.77 |
| 44646.604166666664 | 6.84 |
| 44646.614583333336 | 6.8 |
| 44646.625 | 6.83 |
| 44646.635416666664 | 6.68 |
| 44646.645833333336 | 6.63 |
| 44646.65625 | 6.64 |
| 44646.666666666664 | 6.64 |
| 44646.677083333336 | 6.75 |
| 44646.6875 | 7.2 |
| 44646.697916666664 | 7.61 |
| 44646.708333333336 | 7.86 |
| 44646.71875 | 8.06 |
| 44646.729166666664 | 8.18 |
| 44646.739583333336 | 8.19 |
| 44646.75 | 8.19 |
| 44646.760416666664 | 8.2 |
| 44646.770833333336 | 8.19 |
| 44646.78125 | 8.09 |
| 44646.791666666664 | 8.03 |
| 44646.802083333336 | 8.05 |
| 44646.8125 | 8.06 |
| 44646.822916666664 | 8.08 |
| 44646.833333333336 | 8.08 |
| 44646.84375 | 8.08 |
| 44646.854166666664 | 8.06 |
| 44646.864583333336 | 8.08 |
| 44646.875 | 8.1 |
| 44646.885416666664 | 8.17 |
| 44646.895833333336 | 8.28 |
| 44646.90625 | 8.41 |
| 44646.916666666664 | 8.33 |
| 44646.927083333336 | 8.41 |
| 44646.9375 | 8.5 |
| 44646.947916666664 | 8.46 |
| 44646.958333333336 | 8.45 |
| 44646.96875 | 8.41 |
| 44646.979166666664 | 8.34 |
| 44646.989583333336 | 8.31 |
| 44647.0 | 8.27 |
| 44647.010416666664 | 8.2 |
| 44647.020833333336 | 8.14 |
| 44647.03125 | 8.09 |
| 44647.041666666664 | 8.03 |
| 44647.052083333336 | 7.99 |
| 44647.0625 | 7.93 |
| 44647.072916666664 | 7.91 |
| 44647.083333333336 | 7.89 |
| 44647.09375 | 7.88 |
| 44647.104166666664 | 7.84 |
| 44647.114583333336 | 7.86 |
| 44647.125 | 7.81 |
| 44647.135416666664 | 7.82 |
| 44647.145833333336 | 7.81 |
| 44647.15625 | 7.75 |
| 44647.166666666664 | 7.77 |
| 44647.177083333336 | 7.75 |
| 44647.1875 | 7.92 |
| 44647.197916666664 | 7.97 |
| 44647.208333333336 | 7.95 |
| 44647.21875 | 7.93 |
| 44647.229166666664 | 7.96 |
| 44647.239583333336 | 7.9 |
| 44647.25 | 7.91 |
| 44647.260416666664 | 7.93 |
| 44647.270833333336 | 7.94 |
| 44647.28125 | 7.95 |
| 44647.291666666664 | 7.96 |
| 44647.302083333336 | 7.97 |
| 44647.3125 | 8 |
| 44647.322916666664 | 8.03 |
| 44647.333333333336 | 8.05 |
| 44647.34375 | 8.09 |
| 44647.354166666664 | 8.11 |
| 44647.364583333336 | 8.12 |
| 44647.375 | 8.12 |
| 44647.385416666664 | 8.12 |
| 44647.395833333336 | 8.07 |
| 44647.40625 | 8.07 |
| 44647.416666666664 | 8.08 |
| 44647.427083333336 | 8.03 |
| 44647.4375 | 8.01 |
| 44647.447916666664 | 8.01 |
| 44647.458333333336 | 7.92 |
| 44647.46875 | 7.91 |
| 44647.479166666664 | 7.81 |
| 44647.489583333336 | 7.82 |
| 44647.5 | 7.72 |
| 44647.510416666664 | 7.77 |
| 44647.520833333336 | 7.9 |
| 44647.53125 | 7.86 |
| 44647.541666666664 | 7.93 |
| 44647.552083333336 | 7.94 |
| 44647.5625 | 7.97 |
| 44647.572916666664 | 7.98 |
| 44647.583333333336 | 8 |
| 44647.59375 | 8.03 |
| 44647.604166666664 | 8.03 |
| 44647.614583333336 | 8.03 |
| 44647.625 | 8.04 |
| 44647.635416666664 | 8.04 |
| 44647.645833333336 | 8.06 |
| 44647.65625 | 8.07 |
| 44647.666666666664 | 8.06 |
| 44647.677083333336 | 8.09 |
| 44647.6875 | 8.05 |
| 44647.697916666664 | 8.02 |
| 44647.708333333336 | 8.11 |
| 44647.71875 | 8.33 |
| 44647.729166666664 | 8.46 |
| 44647.739583333336 | 8.54 |
| 44647.75 | 8.65 |
| 44647.760416666664 | 8.75 |
| 44647.770833333336 | 8.83 |
| 44647.78125 | 8.9 |
| 44647.791666666664 | 8.92 |
| 44647.802083333336 | 8.94 |
| 44647.8125 | 8.94 |
| 44647.822916666664 | 8.93 |
| 44647.833333333336 | 8.89 |
| 44647.84375 | 8.86 |
| 44647.854166666664 | 8.84 |
| 44647.864583333336 | 8.83 |
| 44647.875 | 8.8 |
| 44647.885416666664 | 8.8 |
| 44647.895833333336 | 8.77 |
| 44647.90625 | 8.75 |
| 44647.916666666664 | 8.73 |
| 44647.927083333336 | 8.71 |
| 44647.9375 | 8.7 |
| 44647.947916666664 | 8.72 |
| 44647.958333333336 | 8.81 |
| 44647.96875 | 8.82 |
| 44647.979166666664 | 8.86 |
| 44647.989583333336 | 9 |
| 44648.0 | 8.91 |
| 44648.010416666664 | 8.92 |
| 44648.020833333336 | 8.94 |
| 44648.03125 | 8.99 |
| 44648.041666666664 | 8.93 |
| 44648.052083333336 | 8.91 |
| 44648.0625 | 8.86 |
| 44648.072916666664 | 8.82 |
| 44648.083333333336 | 8.79 |
| 44648.09375 | 8.74 |
| 44648.104166666664 | 8.73 |
| 44648.114583333336 | 8.72 |
| 44648.125 | 8.7 |
| 44648.135416666664 | 8.7 |
| 44648.145833333336 | 8.69 |
| 44648.15625 | 8.74 |
| 44648.166666666664 | 8.76 |
| 44648.177083333336 | 8.77 |
| 44648.1875 | 8.72 |
| 44648.197916666664 | 8.68 |
| 44648.208333333336 | 8.65 |
| 44648.21875 | 8.71 |
| 44648.229166666664 | 8.78 |
| 44648.239583333336 | 8.81 |
| 44648.25 | 8.82 |
| 44648.260416666664 | 8.86 |
| 44648.270833333336 | 8.88 |
| 44648.28125 | 8.91 |
| 44648.291666666664 | 8.96 |
| 44648.302083333336 | 9.02 |
| 44648.3125 | 9.07 |
| 44648.322916666664 | 9.14 |
| 44648.333333333336 | 9.17 |
| 44648.34375 | 9.19 |
| 44648.354166666664 | 9.21 |
| 44648.364583333336 | 9.18 |
| 44648.375 | 9.04 |
| 44648.385416666664 | 8.91 |
| 44648.395833333336 | 8.86 |
| 44648.40625 | 8.85 |
| 44648.416666666664 | 8.84 |
| 44648.427083333336 | 8.83 |
| 44648.4375 | 8.83 |
| 44648.447916666664 | 8.81 |
| 44648.458333333336 | 8.79 |
| 44648.46875 | 8.76 |
| 44648.479166666664 | 8.77 |
| 44648.489583333336 | 8.78 |
| 44648.5 | 8.76 |
| 44648.510416666664 | 8.85 |
| 44648.520833333336 | 8.89 |
| 44648.53125 | 8.89 |
| 44648.541666666664 | 9.03 |
| 44648.552083333336 | 9.1 |
| 44648.5625 | 9.18 |
| 44648.572916666664 | 9.2 |
| 44648.583333333336 | 9.17 |
| 44648.59375 | 9.28 |
| 44648.604166666664 | 9.32 |
| 44648.614583333336 | 9.33 |
| 44648.625 | 9.34 |
| 44648.635416666664 | 9.34 |
| 44648.645833333336 | 9.36 |
| 44648.65625 | 9.37 |
| 44648.666666666664 | 9.38 |
| 44648.677083333336 | 9.39 |
| 44648.6875 | 9.41 |
| 44648.697916666664 | 9.38 |
| 44648.708333333336 | 9.42 |
| 44648.71875 | 9.41 |
| 44648.729166666664 | 9.36 |
| 44648.739583333336 | 9.38 |
| 44648.75 | 9.43 |
| 44648.760416666664 | 9.51 |
| 44648.770833333336 | 9.57 |
| 44648.78125 | 9.71 |
| 44648.791666666664 | 9.73 |
| 44648.802083333336 | 9.77 |
| 44648.8125 | 9.79 |
| 44648.822916666664 | 9.8 |
| 44648.833333333336 | 9.8 |
| 44648.84375 | 9.82 |
| 44648.854166666664 | 9.81 |
| 44648.864583333336 | 9.74 |
| 44648.875 | 9.69 |
| 44648.885416666664 | 9.66 |
| 44648.895833333336 | 9.6 |
| 44648.90625 | 9.54 |
| 44648.916666666664 | 9.5 |
| 44648.927083333336 | 9.44 |
| 44648.9375 | 9.43 |
| 44648.947916666664 | 9.4 |
| 44648.958333333336 | 9.37 |
| 44648.96875 | 9.39 |
| 44648.979166666664 | 9.42 |
| 44648.989583333336 | 9.42 |
| 44649.0 | 9.45 |
| 44649.010416666664 | 9.39 |
| 44649.020833333336 | 9.4 |
| 44649.03125 | 9.42 |
| 44649.041666666664 | 9.51 |
| 44649.052083333336 | 9.59 |
| 44649.0625 | 9.7 |
| 44649.072916666664 | 9.69 |
| 44649.083333333336 | 9.72 |
| 44649.09375 | 9.71 |
| 44649.104166666664 | 9.73 |
| 44649.114583333336 | 9.73 |
| 44649.125 | 9.74 |
| 44649.135416666664 | 9.71 |
| 44649.145833333336 | 9.71 |
| 44649.15625 | 9.71 |
| 44649.166666666664 | 9.7 |
| 44649.177083333336 | 9.71 |
| 44649.1875 | 9.68 |
| 44649.197916666664 | 9.68 |
| 44649.208333333336 | 9.65 |
| 44649.21875 | 9.68 |
| 44649.229166666664 | 9.66 |
| 44649.239583333336 | 9.65 |
| 44649.25 | 9.63 |
| 44649.260416666664 | 9.64 |
| 44649.270833333336 | 9.64 |
| 44649.28125 | 9.66 |
| 44649.291666666664 | 9.66 |
| 44649.302083333336 | 9.66 |
| 44649.3125 | 9.63 |
| 44649.322916666664 | 9.64 |
| 44649.333333333336 | 9.62 |
| 44649.34375 | 9.61 |
| 44649.354166666664 | 9.6 |
| 44649.364583333336 | 9.59 |
| 44649.375 | 9.59 |
| 44649.385416666664 | 9.6 |
| 44649.395833333336 | 9.6 |
| 44649.40625 | 9.57 |
| 44649.416666666664 | 9.55 |
| 44649.427083333336 | 9.51 |
| 44649.4375 | 9.49 |
| 44649.447916666664 | 9.48 |
| 44649.458333333336 | 9.47 |
| 44649.46875 | 9.48 |
| 44649.479166666664 | 9.47 |
| 44649.489583333336 | 9.46 |
| 44649.5 | 9.47 |
| 44649.510416666664 | 9.49 |
| 44649.520833333336 | 9.5 |
| 44649.53125 | 9.53 |
| 44649.541666666664 | 9.54 |
| 44649.552083333336 | 9.56 |
| 44649.5625 | 9.59 |
| 44649.572916666664 | 9.63 |
| 44649.583333333336 | 9.72 |
| 44649.59375 | 9.81 |
| 44649.604166666664 | 9.88 |
| 44649.614583333336 | 9.94 |
| 44649.625 | 9.98 |
| 44649.635416666664 | 10.01 |
| 44649.645833333336 | 10.06 |
| 44649.65625 | 10.12 |
| 44649.666666666664 | 10.18 |
| 44649.677083333336 | 10.24 |
| 44649.6875 | 10.28 |
| 44649.697916666664 | 10.31 |
| 44649.708333333336 | 10.33 |
| 44649.71875 | 10.34 |
| 44649.729166666664 | 10.33 |
| 44649.739583333336 | 10.36 |
| 44649.75 | 10.35 |
| 44649.760416666664 | 10.38 |
| 44649.770833333336 | 10.37 |
| 44649.78125 | 10.36 |
| 44649.791666666664 | 10.34 |
| 44649.802083333336 | 10.43 |
| 44649.8125 | 10.48 |
| 44649.822916666664 | 10.52 |
| 44649.833333333336 | 10.53 |
| 44649.84375 | 10.6 |
| 44649.854166666664 | 10.62 |
| 44649.864583333336 | 10.64 |
| 44649.875 | 10.62 |
| 44649.885416666664 | 10.59 |
| 44649.895833333336 | 10.52 |
| 44649.90625 | 10.48 |
| 44649.916666666664 | 10.4 |
| 44649.927083333336 | 10.28 |
| 44649.9375 | 10.17 |
| 44649.947916666664 | 10.11 |
| 44649.958333333336 | 10.06 |
| 44649.96875 | 10.02 |
| 44649.979166666664 | 9.99 |
| 44649.989583333336 | 9.97 |
| 44650.0 | 9.9 |
| 44650.010416666664 | 9.72 |
| 44650.020833333336 | 9.93 |
| 44650.03125 | 9.93 |
| 44650.041666666664 | 9.9 |
| 44650.052083333336 | 9.95 |
| 44650.0625 | 9.96 |
| 44650.072916666664 | 9.92 |
| 44650.083333333336 | 9.9 |
| 44650.09375 | 9.98 |
| 44650.104166666664 | 10 |
| 44650.114583333336 | 10 |
| 44650.125 | 10.09 |
| 44650.135416666664 | 10.09 |
| 44650.145833333336 | 10.12 |
| 44650.15625 | 10.13 |
| 44650.166666666664 | 10.08 |
| 44650.177083333336 | 10.05 |
| 44650.1875 | 10.02 |
| 44650.197916666664 | 9.99 |
| 44650.208333333336 | 9.98 |
| 44650.21875 | 9.9 |
| 44650.229166666664 | 9.89 |
| 44650.239583333336 | 9.88 |
| 44650.25 | 9.8 |
| 44650.260416666664 | 9.85 |
| 44650.270833333336 | 9.89 |
| 44650.28125 | 9.91 |
| 44650.291666666664 | 9.9 |
| 44650.302083333336 | 9.89 |
| 44650.3125 | 9.85 |
| 44650.322916666664 | 9.8 |
| 44650.333333333336 | 9.74 |
| 44650.34375 | 9.66 |
| 44650.354166666664 | 9.58 |
| 44650.364583333336 | 9.53 |
| 44650.375 | 9.45 |
| 44650.385416666664 | 9.36 |
| 44650.395833333336 | 9.29 |
| 44650.40625 | 9.25 |
| 44650.416666666664 | 9.25 |
| 44650.427083333336 | 9.26 |
| 44650.4375 | 9.28 |
| 44650.447916666664 | 9.28 |
| 44650.458333333336 | 9.3 |
| 44650.46875 | 9.32 |
| 44650.479166666664 | 9.33 |
| 44650.489583333336 | 9.36 |
| 44650.5 | 9.37 |
| 44650.510416666664 | 9.38 |
| 44650.520833333336 | 9.34 |
| 44650.53125 | 9.15 |
| 44650.541666666664 | 9.3 |
| 44650.552083333336 | 9.33 |
| 44650.5625 | 9.33 |
| 44650.572916666664 | 9.37 |
| 44650.583333333336 | 9.37 |
| 44650.59375 | 9.37 |
| 44650.604166666664 | 9.38 |
| 44650.614583333336 | 9.39 |
| 44650.625 | 9.42 |
| 44650.635416666664 | 9.45 |
| 44650.645833333336 | 9.5 |
| 44650.65625 | 9.54 |
| 44650.666666666664 | 9.59 |
| 44650.677083333336 | 9.61 |
| 44650.6875 | 9.64 |
| 44650.697916666664 | 9.68 |
| 44650.708333333336 | 9.73 |
| 44650.71875 | 9.74 |
| 44650.729166666664 | 9.76 |
| 44650.739583333336 | 9.45 |
| 44650.75 | 9.47 |
| 44650.760416666664 | 9.49 |
| 44650.770833333336 | 9.5 |
| 44650.78125 | 9.54 |
| 44650.791666666664 | 9.51 |
| 44650.802083333336 | 9.46 |
| 44650.8125 | 9.49 |
| 44650.822916666664 | 9.55 |
| 44650.833333333336 | 9.67 |
| 44650.84375 | 9.83 |
| 44650.854166666664 | 9.91 |
| 44650.864583333336 | 9.93 |
| 44650.875 | 9.93 |
| 44650.885416666664 | 9.89 |
| 44650.895833333336 | 9.84 |
| 44650.90625 | 9.76 |
| 44650.916666666664 | 9.7 |
| 44650.927083333336 | 9.63 |
| 44650.9375 | 9.59 |
| 44650.947916666664 | 9.56 |
| 44650.958333333336 | 9.54 |
| 44650.96875 | 9.51 |
| 44650.979166666664 | 9.49 |
| 44650.989583333336 | 9.48 |
| 44651.0 | 9.45 |
| 44651.010416666664 | 9.43 |
| 44651.020833333336 | 9.42 |
| 44651.03125 | 9.4 |
| 44651.041666666664 | 9.4 |
| 44651.052083333336 | 9.43 |
| 44651.0625 | 9.38 |
| 44651.072916666664 | 9.36 |
| 44651.083333333336 | 9.28 |
| 44651.09375 | 9.24 |
| 44651.104166666664 | 9.18 |
| 44651.114583333336 | 9.13 |
| 44651.125 | 9.1 |
| 44651.135416666664 | 8.96 |
| 44651.145833333336 | 8.88 |
| 44651.15625 | 8.86 |
| 44651.166666666664 | 8.98 |
| 44651.177083333336 | 9.11 |
| 44651.1875 | 9.11 |
| 44651.197916666664 | 9.12 |
| 44651.208333333336 | 9.13 |
| 44651.21875 | 9.13 |
| 44651.229166666664 | 9.13 |
| 44651.239583333336 | 9.09 |
| 44651.25 | 9.06 |
| 44651.260416666664 | 9.02 |
| 44651.270833333336 | 8.99 |
| 44651.28125 | 9.01 |
| 44651.291666666664 | 8.97 |
| 44651.302083333336 | 8.97 |
| 44651.3125 | 8.96 |
| 44651.322916666664 | 8.94 |
| 44651.333333333336 | 8.92 |
| 44651.34375 | 8.94 |
| 44651.354166666664 | 8.93 |
| 44651.364583333336 | 8.86 |
| 44651.375 | 8.78 |
| 44651.385416666664 | 8.76 |
| 44651.395833333336 | 8.74 |
| 44651.40625 | 8.7 |
| 44651.416666666664 | 8.69 |
| 44651.427083333336 | 8.68 |
| 44651.4375 | 8.69 |
| 44651.447916666664 | 8.72 |
| 44651.458333333336 | 8.74 |
| 44651.46875 | 8.78 |
| 44651.479166666664 | 8.81 |
| 44651.489583333336 | 8.83 |
| 44651.5 | 8.83 |
| 44651.510416666664 | 8.83 |
| 44651.520833333336 | 8.83 |
| 44651.53125 | 8.83 |
| 44651.541666666664 | 8.83 |
| 44651.552083333336 | 8.83 |
| 44651.5625 | 8.83 |
| 44651.572916666664 | 8.79 |
| 44651.583333333336 | 8.81 |
| 44651.59375 | 8.89 |
| 44651.604166666664 | 8.92 |
| 44651.614583333336 | 8.94 |
| 44651.625 | 8.95 |
| 44651.635416666664 | 8.93 |
| 44651.645833333336 | 9 |
| 44651.65625 | 8.98 |
| 44651.666666666664 | 9 |
| 44651.677083333336 | 8.99 |
| 44651.6875 | 8.99 |
| 44651.697916666664 | 8.98 |
| 44651.708333333336 | 8.99 |
| 44651.71875 | 8.99 |
| 44651.729166666664 | 9 |
| 44651.739583333336 | 9.01 |
| 44651.75 | 9 |
| 44651.760416666664 | 9 |
| 44651.770833333336 | 8.99 |
| 44651.78125 | 8.99 |
| 44651.791666666664 | 8.99 |
| 44651.802083333336 | 8.99 |
| 44651.8125 | 8.95 |
| 44651.822916666664 | 8.91 |
| 44651.833333333336 | 8.89 |
| 44651.84375 | 8.85 |
| 44651.854166666664 | 8.81 |
| 44651.864583333336 | 8.71 |
| 44651.875 | 8.63 |
| 44651.885416666664 | 8.55 |
| 44651.895833333336 | 8.49 |
| 44651.90625 | 8.46 |
| 44651.916666666664 | 8.45 |
| 44651.927083333336 | 8.43 |
| 44651.9375 | 8.45 |
| 44651.947916666664 | 8.45 |
| 44651.958333333336 | 8.45 |
| 44651.96875 | 8.46 |
| 44651.979166666664 | 8.48 |
| 44651.989583333336 | 8.5 |
| 44652.0 | 8.53 |
| 44652.010416666664 | 8.52 |
| 44652.020833333336 | 8.53 |
| 44652.03125 | 8.53 |
| 44652.041666666664 | 8.53 |
| 44652.052083333336 | 8.51 |
| 44652.0625 | 8.51 |
| 44652.072916666664 | 8.49 |
| 44652.083333333336 | 8.46 |
| 44652.09375 | 8.44 |
| 44652.104166666664 | 8.4 |
| 44652.114583333336 | 8.3 |
| 44652.125 | 8.24 |
| 44652.135416666664 | 8.15 |
| 44652.145833333336 | 8.12 |